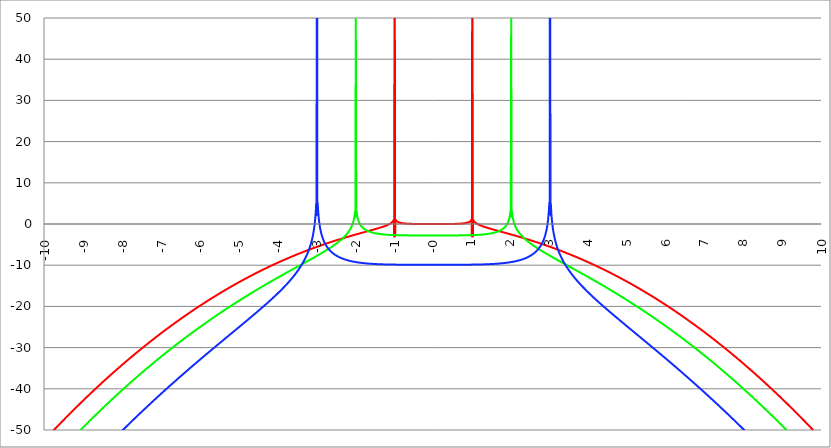
| Category | Series 1 | Series 0 | Series 2 |
|---|---|---|---|
| -10.0 | -52.298 | -59.129 | -70.299 |
| -9.99 | -52.197 | -59.025 | -70.189 |
| -9.98 | -52.096 | -58.921 | -70.079 |
| -9.97 | -51.995 | -58.817 | -69.97 |
| -9.96 | -51.894 | -58.713 | -69.86 |
| -9.95 | -51.794 | -58.609 | -69.751 |
| -9.940000000000001 | -51.693 | -58.505 | -69.641 |
| -9.930000000000001 | -51.593 | -58.402 | -69.532 |
| -9.920000000000002 | -51.493 | -58.298 | -69.423 |
| -9.91 | -51.392 | -58.195 | -69.313 |
| -9.900000000000002 | -51.292 | -58.092 | -69.204 |
| -9.890000000000002 | -51.192 | -57.989 | -69.095 |
| -9.880000000000003 | -51.093 | -57.886 | -68.987 |
| -9.870000000000003 | -50.993 | -57.783 | -68.878 |
| -9.860000000000001 | -50.893 | -57.68 | -68.769 |
| -9.850000000000003 | -50.794 | -57.577 | -68.66 |
| -9.840000000000003 | -50.694 | -57.474 | -68.552 |
| -9.830000000000004 | -50.595 | -57.372 | -68.443 |
| -9.820000000000004 | -50.495 | -57.269 | -68.335 |
| -9.810000000000004 | -50.396 | -57.167 | -68.227 |
| -9.800000000000004 | -50.297 | -57.064 | -68.119 |
| -9.790000000000004 | -50.198 | -56.962 | -68.011 |
| -9.780000000000005 | -50.099 | -56.86 | -67.903 |
| -9.770000000000005 | -50.001 | -56.758 | -67.795 |
| -9.760000000000005 | -49.902 | -56.656 | -67.687 |
| -9.750000000000005 | -49.803 | -56.554 | -67.579 |
| -9.740000000000006 | -49.705 | -56.453 | -67.471 |
| -9.730000000000006 | -49.606 | -56.351 | -67.364 |
| -9.720000000000006 | -49.508 | -56.249 | -67.256 |
| -9.710000000000006 | -49.41 | -56.148 | -67.149 |
| -9.700000000000006 | -49.312 | -56.047 | -67.042 |
| -9.690000000000007 | -49.214 | -55.945 | -66.934 |
| -9.680000000000007 | -49.116 | -55.844 | -66.827 |
| -9.670000000000007 | -49.018 | -55.743 | -66.72 |
| -9.660000000000007 | -48.92 | -55.642 | -66.613 |
| -9.650000000000007 | -48.823 | -55.541 | -66.506 |
| -9.640000000000008 | -48.725 | -55.44 | -66.4 |
| -9.630000000000008 | -48.628 | -55.34 | -66.293 |
| -9.620000000000008 | -48.531 | -55.239 | -66.186 |
| -9.610000000000008 | -48.433 | -55.139 | -66.08 |
| -9.600000000000009 | -48.336 | -55.038 | -65.973 |
| -9.590000000000009 | -48.239 | -54.938 | -65.867 |
| -9.580000000000007 | -48.142 | -54.838 | -65.761 |
| -9.57000000000001 | -48.046 | -54.738 | -65.655 |
| -9.56000000000001 | -47.949 | -54.638 | -65.549 |
| -9.55000000000001 | -47.852 | -54.538 | -65.443 |
| -9.54000000000001 | -47.756 | -54.438 | -65.337 |
| -9.53000000000001 | -47.659 | -54.338 | -65.231 |
| -9.52000000000001 | -47.563 | -54.239 | -65.125 |
| -9.51000000000001 | -47.467 | -54.139 | -65.019 |
| -9.50000000000001 | -47.371 | -54.04 | -64.914 |
| -9.49000000000001 | -47.275 | -53.94 | -64.808 |
| -9.48000000000001 | -47.179 | -53.841 | -64.703 |
| -9.47000000000001 | -47.083 | -53.742 | -64.598 |
| -9.46000000000001 | -46.987 | -53.643 | -64.492 |
| -9.45000000000001 | -46.892 | -53.544 | -64.387 |
| -9.44000000000001 | -46.796 | -53.445 | -64.282 |
| -9.430000000000012 | -46.701 | -53.346 | -64.177 |
| -9.420000000000012 | -46.605 | -53.247 | -64.072 |
| -9.410000000000013 | -46.51 | -53.149 | -63.968 |
| -9.400000000000013 | -46.415 | -53.05 | -63.863 |
| -9.390000000000011 | -46.32 | -52.952 | -63.758 |
| -9.380000000000013 | -46.225 | -52.853 | -63.654 |
| -9.370000000000013 | -46.13 | -52.755 | -63.549 |
| -9.360000000000014 | -46.036 | -52.657 | -63.445 |
| -9.350000000000014 | -45.941 | -52.559 | -63.341 |
| -9.340000000000014 | -45.846 | -52.461 | -63.237 |
| -9.330000000000014 | -45.752 | -52.363 | -63.132 |
| -9.320000000000014 | -45.658 | -52.266 | -63.028 |
| -9.310000000000015 | -45.563 | -52.168 | -62.925 |
| -9.300000000000013 | -45.469 | -52.07 | -62.821 |
| -9.290000000000015 | -45.375 | -51.973 | -62.717 |
| -9.280000000000015 | -45.281 | -51.876 | -62.613 |
| -9.270000000000016 | -45.187 | -51.778 | -62.51 |
| -9.260000000000016 | -45.094 | -51.681 | -62.406 |
| -9.250000000000014 | -45 | -51.584 | -62.303 |
| -9.240000000000016 | -44.906 | -51.487 | -62.199 |
| -9.230000000000016 | -44.813 | -51.39 | -62.096 |
| -9.220000000000017 | -44.72 | -51.293 | -61.993 |
| -9.210000000000017 | -44.626 | -51.197 | -61.89 |
| -9.200000000000017 | -44.533 | -51.1 | -61.787 |
| -9.190000000000017 | -44.44 | -51.003 | -61.684 |
| -9.180000000000017 | -44.347 | -50.907 | -61.581 |
| -9.170000000000018 | -44.254 | -50.811 | -61.478 |
| -9.160000000000016 | -44.162 | -50.714 | -61.376 |
| -9.150000000000018 | -44.069 | -50.618 | -61.273 |
| -9.140000000000018 | -43.976 | -50.522 | -61.171 |
| -9.130000000000019 | -43.884 | -50.426 | -61.068 |
| -9.120000000000019 | -43.792 | -50.331 | -60.966 |
| -9.110000000000017 | -43.699 | -50.235 | -60.864 |
| -9.10000000000002 | -43.607 | -50.139 | -60.762 |
| -9.09000000000002 | -43.515 | -50.044 | -60.66 |
| -9.08000000000002 | -43.423 | -49.948 | -60.558 |
| -9.07000000000002 | -43.331 | -49.853 | -60.456 |
| -9.06000000000002 | -43.24 | -49.757 | -60.354 |
| -9.05000000000002 | -43.148 | -49.662 | -60.252 |
| -9.04000000000002 | -43.056 | -49.567 | -60.151 |
| -9.03000000000002 | -42.965 | -49.472 | -60.049 |
| -9.020000000000021 | -42.873 | -49.377 | -59.948 |
| -9.010000000000021 | -42.782 | -49.282 | -59.846 |
| -9.000000000000021 | -42.691 | -49.188 | -59.745 |
| -8.990000000000022 | -42.6 | -49.093 | -59.644 |
| -8.980000000000022 | -42.509 | -48.998 | -59.543 |
| -8.97000000000002 | -42.418 | -48.904 | -59.442 |
| -8.960000000000022 | -42.327 | -48.81 | -59.341 |
| -8.950000000000022 | -42.237 | -48.715 | -59.24 |
| -8.940000000000023 | -42.146 | -48.621 | -59.139 |
| -8.930000000000023 | -42.056 | -48.527 | -59.038 |
| -8.920000000000023 | -41.965 | -48.433 | -58.938 |
| -8.910000000000023 | -41.875 | -48.339 | -58.837 |
| -8.900000000000023 | -41.785 | -48.246 | -58.737 |
| -8.890000000000024 | -41.695 | -48.152 | -58.636 |
| -8.880000000000024 | -41.605 | -48.058 | -58.536 |
| -8.870000000000024 | -41.515 | -47.965 | -58.436 |
| -8.860000000000024 | -41.425 | -47.871 | -58.336 |
| -8.850000000000025 | -41.335 | -47.778 | -58.236 |
| -8.840000000000025 | -41.246 | -47.685 | -58.136 |
| -8.830000000000025 | -41.156 | -47.592 | -58.036 |
| -8.820000000000025 | -41.067 | -47.499 | -57.936 |
| -8.810000000000025 | -40.977 | -47.406 | -57.836 |
| -8.800000000000026 | -40.888 | -47.313 | -57.737 |
| -8.790000000000026 | -40.799 | -47.22 | -57.637 |
| -8.780000000000026 | -40.71 | -47.128 | -57.538 |
| -8.770000000000026 | -40.621 | -47.035 | -57.438 |
| -8.760000000000026 | -40.532 | -46.943 | -57.339 |
| -8.750000000000027 | -40.444 | -46.85 | -57.24 |
| -8.740000000000027 | -40.355 | -46.758 | -57.141 |
| -8.730000000000027 | -40.267 | -46.666 | -57.042 |
| -8.720000000000027 | -40.178 | -46.574 | -56.943 |
| -8.710000000000027 | -40.09 | -46.482 | -56.844 |
| -8.700000000000028 | -40.002 | -46.39 | -56.745 |
| -8.690000000000028 | -39.914 | -46.298 | -56.647 |
| -8.680000000000028 | -39.826 | -46.206 | -56.548 |
| -8.670000000000028 | -39.738 | -46.115 | -56.449 |
| -8.660000000000029 | -39.65 | -46.023 | -56.351 |
| -8.650000000000029 | -39.562 | -45.932 | -56.253 |
| -8.640000000000029 | -39.474 | -45.84 | -56.154 |
| -8.63000000000003 | -39.387 | -45.749 | -56.056 |
| -8.62000000000003 | -39.3 | -45.658 | -55.958 |
| -8.61000000000003 | -39.212 | -45.567 | -55.86 |
| -8.60000000000003 | -39.125 | -45.476 | -55.762 |
| -8.59000000000003 | -39.038 | -45.385 | -55.664 |
| -8.58000000000003 | -38.951 | -45.294 | -55.566 |
| -8.57000000000003 | -38.864 | -45.204 | -55.469 |
| -8.56000000000003 | -38.777 | -45.113 | -55.371 |
| -8.55000000000003 | -38.69 | -45.022 | -55.273 |
| -8.540000000000031 | -38.604 | -44.932 | -55.176 |
| -8.530000000000031 | -38.517 | -44.842 | -55.079 |
| -8.520000000000032 | -38.431 | -44.752 | -54.981 |
| -8.510000000000032 | -38.344 | -44.661 | -54.884 |
| -8.50000000000003 | -38.258 | -44.571 | -54.787 |
| -8.490000000000032 | -38.172 | -44.481 | -54.69 |
| -8.480000000000032 | -38.086 | -44.392 | -54.593 |
| -8.470000000000033 | -38 | -44.302 | -54.496 |
| -8.460000000000033 | -37.914 | -44.212 | -54.399 |
| -8.450000000000033 | -37.828 | -44.123 | -54.302 |
| -8.440000000000033 | -37.743 | -44.033 | -54.206 |
| -8.430000000000033 | -37.657 | -43.944 | -54.109 |
| -8.420000000000034 | -37.572 | -43.854 | -54.013 |
| -8.410000000000032 | -37.486 | -43.765 | -53.916 |
| -8.400000000000034 | -37.401 | -43.676 | -53.82 |
| -8.390000000000034 | -37.316 | -43.587 | -53.724 |
| -8.380000000000035 | -37.231 | -43.498 | -53.628 |
| -8.370000000000035 | -37.146 | -43.409 | -53.532 |
| -8.360000000000033 | -37.061 | -43.321 | -53.436 |
| -8.350000000000035 | -36.976 | -43.232 | -53.34 |
| -8.340000000000035 | -36.892 | -43.144 | -53.244 |
| -8.330000000000036 | -36.807 | -43.055 | -53.148 |
| -8.320000000000036 | -36.723 | -42.967 | -53.052 |
| -8.310000000000034 | -36.638 | -42.879 | -52.957 |
| -8.300000000000036 | -36.554 | -42.79 | -52.861 |
| -8.290000000000036 | -36.47 | -42.702 | -52.766 |
| -8.280000000000037 | -36.386 | -42.614 | -52.671 |
| -8.270000000000037 | -36.302 | -42.526 | -52.575 |
| -8.260000000000037 | -36.218 | -42.439 | -52.48 |
| -8.250000000000037 | -36.134 | -42.351 | -52.385 |
| -8.240000000000038 | -36.05 | -42.263 | -52.29 |
| -8.230000000000038 | -35.967 | -42.176 | -52.195 |
| -8.220000000000038 | -35.883 | -42.088 | -52.1 |
| -8.210000000000038 | -35.8 | -42.001 | -52.005 |
| -8.200000000000038 | -35.717 | -41.914 | -51.911 |
| -8.190000000000039 | -35.633 | -41.827 | -51.816 |
| -8.180000000000039 | -35.55 | -41.74 | -51.721 |
| -8.170000000000037 | -35.467 | -41.653 | -51.627 |
| -8.16000000000004 | -35.384 | -41.566 | -51.533 |
| -8.15000000000004 | -35.302 | -41.479 | -51.438 |
| -8.14000000000004 | -35.219 | -41.392 | -51.344 |
| -8.13000000000004 | -35.136 | -41.306 | -51.25 |
| -8.12000000000004 | -35.054 | -41.219 | -51.156 |
| -8.11000000000004 | -34.971 | -41.133 | -51.062 |
| -8.10000000000004 | -34.889 | -41.047 | -50.968 |
| -8.09000000000004 | -34.807 | -40.96 | -50.874 |
| -8.08000000000004 | -34.725 | -40.874 | -50.78 |
| -8.07000000000004 | -34.643 | -40.788 | -50.687 |
| -8.06000000000004 | -34.561 | -40.702 | -50.593 |
| -8.05000000000004 | -34.479 | -40.617 | -50.499 |
| -8.040000000000042 | -34.397 | -40.531 | -50.406 |
| -8.03000000000004 | -34.316 | -40.445 | -50.313 |
| -8.020000000000042 | -34.234 | -40.36 | -50.219 |
| -8.010000000000042 | -34.153 | -40.274 | -50.126 |
| -8.000000000000043 | -34.072 | -40.189 | -50.033 |
| -7.990000000000043 | -33.99 | -40.103 | -49.94 |
| -7.980000000000043 | -33.909 | -40.018 | -49.847 |
| -7.970000000000043 | -33.828 | -39.933 | -49.754 |
| -7.960000000000043 | -33.747 | -39.848 | -49.661 |
| -7.950000000000044 | -33.666 | -39.763 | -49.569 |
| -7.940000000000044 | -33.586 | -39.678 | -49.476 |
| -7.930000000000044 | -33.505 | -39.594 | -49.383 |
| -7.920000000000044 | -33.425 | -39.509 | -49.291 |
| -7.910000000000044 | -33.344 | -39.424 | -49.198 |
| -7.900000000000044 | -33.264 | -39.34 | -49.106 |
| -7.890000000000045 | -33.184 | -39.256 | -49.014 |
| -7.880000000000045 | -33.103 | -39.171 | -48.922 |
| -7.870000000000045 | -33.023 | -39.087 | -48.829 |
| -7.860000000000046 | -32.943 | -39.003 | -48.737 |
| -7.850000000000046 | -32.864 | -38.919 | -48.645 |
| -7.840000000000046 | -32.784 | -38.835 | -48.554 |
| -7.830000000000046 | -32.704 | -38.751 | -48.462 |
| -7.820000000000046 | -32.625 | -38.668 | -48.37 |
| -7.810000000000047 | -32.545 | -38.584 | -48.278 |
| -7.800000000000047 | -32.466 | -38.5 | -48.187 |
| -7.790000000000047 | -32.387 | -38.417 | -48.095 |
| -7.780000000000047 | -32.307 | -38.334 | -48.004 |
| -7.770000000000047 | -32.228 | -38.25 | -47.912 |
| -7.760000000000048 | -32.149 | -38.167 | -47.821 |
| -7.750000000000048 | -32.071 | -38.084 | -47.73 |
| -7.740000000000048 | -31.992 | -38.001 | -47.639 |
| -7.730000000000048 | -31.913 | -37.918 | -47.548 |
| -7.720000000000049 | -31.835 | -37.836 | -47.457 |
| -7.710000000000049 | -31.756 | -37.753 | -47.366 |
| -7.700000000000049 | -31.678 | -37.67 | -47.275 |
| -7.690000000000049 | -31.599 | -37.588 | -47.184 |
| -7.680000000000049 | -31.521 | -37.505 | -47.094 |
| -7.67000000000005 | -31.443 | -37.423 | -47.003 |
| -7.66000000000005 | -31.365 | -37.341 | -46.913 |
| -7.65000000000005 | -31.287 | -37.258 | -46.822 |
| -7.64000000000005 | -31.21 | -37.176 | -46.732 |
| -7.63000000000005 | -31.132 | -37.094 | -46.642 |
| -7.620000000000051 | -31.054 | -37.013 | -46.551 |
| -7.610000000000051 | -30.977 | -36.931 | -46.461 |
| -7.600000000000051 | -30.899 | -36.849 | -46.371 |
| -7.590000000000051 | -30.822 | -36.767 | -46.281 |
| -7.580000000000052 | -30.745 | -36.686 | -46.191 |
| -7.570000000000052 | -30.668 | -36.605 | -46.101 |
| -7.560000000000052 | -30.591 | -36.523 | -46.012 |
| -7.550000000000052 | -30.514 | -36.442 | -45.922 |
| -7.540000000000052 | -30.437 | -36.361 | -45.832 |
| -7.530000000000053 | -30.36 | -36.28 | -45.743 |
| -7.520000000000053 | -30.284 | -36.199 | -45.653 |
| -7.510000000000053 | -30.207 | -36.118 | -45.564 |
| -7.500000000000053 | -30.131 | -36.037 | -45.475 |
| -7.490000000000053 | -30.055 | -35.956 | -45.385 |
| -7.480000000000054 | -29.978 | -35.876 | -45.296 |
| -7.470000000000054 | -29.902 | -35.795 | -45.207 |
| -7.460000000000054 | -29.826 | -35.715 | -45.118 |
| -7.450000000000054 | -29.75 | -35.635 | -45.029 |
| -7.440000000000054 | -29.675 | -35.554 | -44.94 |
| -7.430000000000054 | -29.599 | -35.474 | -44.851 |
| -7.420000000000055 | -29.523 | -35.394 | -44.763 |
| -7.410000000000055 | -29.448 | -35.314 | -44.674 |
| -7.400000000000055 | -29.372 | -35.234 | -44.585 |
| -7.390000000000056 | -29.297 | -35.154 | -44.497 |
| -7.380000000000056 | -29.222 | -35.075 | -44.408 |
| -7.370000000000056 | -29.147 | -34.995 | -44.32 |
| -7.360000000000056 | -29.072 | -34.916 | -44.232 |
| -7.350000000000056 | -28.997 | -34.836 | -44.143 |
| -7.340000000000057 | -28.922 | -34.757 | -44.055 |
| -7.330000000000057 | -28.847 | -34.678 | -43.967 |
| -7.320000000000057 | -28.772 | -34.598 | -43.879 |
| -7.310000000000057 | -28.698 | -34.519 | -43.791 |
| -7.300000000000058 | -28.623 | -34.44 | -43.703 |
| -7.290000000000058 | -28.549 | -34.362 | -43.616 |
| -7.280000000000058 | -28.475 | -34.283 | -43.528 |
| -7.270000000000058 | -28.401 | -34.204 | -43.44 |
| -7.260000000000058 | -28.327 | -34.125 | -43.353 |
| -7.250000000000059 | -28.253 | -34.047 | -43.265 |
| -7.240000000000059 | -28.179 | -33.969 | -43.178 |
| -7.23000000000006 | -28.105 | -33.89 | -43.09 |
| -7.220000000000059 | -28.031 | -33.812 | -43.003 |
| -7.210000000000059 | -27.958 | -33.734 | -42.916 |
| -7.20000000000006 | -27.884 | -33.656 | -42.829 |
| -7.19000000000006 | -27.811 | -33.578 | -42.742 |
| -7.18000000000006 | -27.738 | -33.5 | -42.655 |
| -7.17000000000006 | -27.665 | -33.422 | -42.568 |
| -7.160000000000061 | -27.591 | -33.344 | -42.481 |
| -7.150000000000061 | -27.518 | -33.267 | -42.394 |
| -7.140000000000061 | -27.446 | -33.189 | -42.307 |
| -7.130000000000061 | -27.373 | -33.112 | -42.22 |
| -7.120000000000061 | -27.3 | -33.034 | -42.134 |
| -7.110000000000062 | -27.228 | -32.957 | -42.047 |
| -7.100000000000062 | -27.155 | -32.88 | -41.961 |
| -7.090000000000062 | -27.083 | -32.803 | -41.874 |
| -7.080000000000062 | -27.01 | -32.726 | -41.788 |
| -7.070000000000062 | -26.938 | -32.649 | -41.702 |
| -7.060000000000063 | -26.866 | -32.572 | -41.616 |
| -7.050000000000063 | -26.794 | -32.496 | -41.53 |
| -7.040000000000063 | -26.722 | -32.419 | -41.443 |
| -7.030000000000063 | -26.65 | -32.342 | -41.358 |
| -7.020000000000064 | -26.579 | -32.266 | -41.272 |
| -7.010000000000064 | -26.507 | -32.19 | -41.186 |
| -7.000000000000064 | -26.436 | -32.113 | -41.1 |
| -6.990000000000064 | -26.364 | -32.037 | -41.014 |
| -6.980000000000064 | -26.293 | -31.961 | -40.929 |
| -6.970000000000064 | -26.222 | -31.885 | -40.843 |
| -6.960000000000064 | -26.151 | -31.809 | -40.757 |
| -6.950000000000064 | -26.08 | -31.733 | -40.672 |
| -6.940000000000065 | -26.009 | -31.658 | -40.587 |
| -6.930000000000065 | -25.938 | -31.582 | -40.501 |
| -6.920000000000065 | -25.867 | -31.506 | -40.416 |
| -6.910000000000065 | -25.796 | -31.431 | -40.331 |
| -6.900000000000066 | -25.726 | -31.356 | -40.246 |
| -6.890000000000066 | -25.655 | -31.28 | -40.161 |
| -6.880000000000066 | -25.585 | -31.205 | -40.076 |
| -6.870000000000066 | -25.515 | -31.13 | -39.991 |
| -6.860000000000067 | -25.445 | -31.055 | -39.906 |
| -6.850000000000067 | -25.375 | -30.98 | -39.821 |
| -6.840000000000067 | -25.305 | -30.905 | -39.736 |
| -6.830000000000067 | -25.235 | -30.83 | -39.652 |
| -6.820000000000068 | -25.165 | -30.756 | -39.567 |
| -6.810000000000068 | -25.096 | -30.681 | -39.483 |
| -6.800000000000068 | -25.026 | -30.607 | -39.398 |
| -6.790000000000068 | -24.957 | -30.532 | -39.314 |
| -6.780000000000068 | -24.887 | -30.458 | -39.229 |
| -6.770000000000068 | -24.818 | -30.384 | -39.145 |
| -6.760000000000069 | -24.749 | -30.31 | -39.061 |
| -6.75000000000007 | -24.68 | -30.236 | -38.977 |
| -6.74000000000007 | -24.611 | -30.162 | -38.893 |
| -6.73000000000007 | -24.542 | -30.088 | -38.809 |
| -6.72000000000007 | -24.473 | -30.014 | -38.725 |
| -6.71000000000007 | -24.404 | -29.94 | -38.641 |
| -6.70000000000007 | -24.336 | -29.867 | -38.557 |
| -6.69000000000007 | -24.267 | -29.793 | -38.473 |
| -6.680000000000071 | -24.199 | -29.72 | -38.39 |
| -6.670000000000071 | -24.131 | -29.647 | -38.306 |
| -6.660000000000071 | -24.063 | -29.573 | -38.222 |
| -6.650000000000071 | -23.994 | -29.5 | -38.139 |
| -6.640000000000072 | -23.926 | -29.427 | -38.055 |
| -6.630000000000072 | -23.859 | -29.354 | -37.972 |
| -6.620000000000072 | -23.791 | -29.281 | -37.889 |
| -6.610000000000072 | -23.723 | -29.208 | -37.805 |
| -6.600000000000072 | -23.655 | -29.136 | -37.722 |
| -6.590000000000073 | -23.588 | -29.063 | -37.639 |
| -6.580000000000073 | -23.521 | -28.99 | -37.556 |
| -6.570000000000073 | -23.453 | -28.918 | -37.473 |
| -6.560000000000073 | -23.386 | -28.846 | -37.39 |
| -6.550000000000074 | -23.319 | -28.773 | -37.307 |
| -6.540000000000074 | -23.252 | -28.701 | -37.224 |
| -6.530000000000074 | -23.185 | -28.629 | -37.141 |
| -6.520000000000074 | -23.118 | -28.557 | -37.059 |
| -6.510000000000074 | -23.051 | -28.485 | -36.976 |
| -6.500000000000074 | -22.985 | -28.413 | -36.893 |
| -6.490000000000074 | -22.918 | -28.342 | -36.811 |
| -6.480000000000074 | -22.852 | -28.27 | -36.728 |
| -6.470000000000075 | -22.786 | -28.198 | -36.646 |
| -6.460000000000075 | -22.719 | -28.127 | -36.563 |
| -6.450000000000075 | -22.653 | -28.055 | -36.481 |
| -6.440000000000075 | -22.587 | -27.984 | -36.399 |
| -6.430000000000076 | -22.521 | -27.913 | -36.317 |
| -6.420000000000076 | -22.455 | -27.842 | -36.234 |
| -6.410000000000076 | -22.39 | -27.771 | -36.152 |
| -6.400000000000076 | -22.324 | -27.7 | -36.07 |
| -6.390000000000077 | -22.258 | -27.629 | -35.988 |
| -6.380000000000077 | -22.193 | -27.558 | -35.906 |
| -6.370000000000077 | -22.128 | -27.487 | -35.824 |
| -6.360000000000078 | -22.062 | -27.417 | -35.743 |
| -6.350000000000078 | -21.997 | -27.346 | -35.661 |
| -6.340000000000078 | -21.932 | -27.276 | -35.579 |
| -6.330000000000078 | -21.867 | -27.205 | -35.497 |
| -6.320000000000078 | -21.802 | -27.135 | -35.416 |
| -6.310000000000079 | -21.737 | -27.065 | -35.334 |
| -6.300000000000079 | -21.673 | -26.995 | -35.253 |
| -6.29000000000008 | -21.608 | -26.925 | -35.171 |
| -6.28000000000008 | -21.544 | -26.855 | -35.09 |
| -6.27000000000008 | -21.479 | -26.785 | -35.009 |
| -6.26000000000008 | -21.415 | -26.715 | -34.927 |
| -6.25000000000008 | -21.351 | -26.646 | -34.846 |
| -6.24000000000008 | -21.287 | -26.576 | -34.765 |
| -6.23000000000008 | -21.223 | -26.506 | -34.684 |
| -6.220000000000081 | -21.159 | -26.437 | -34.603 |
| -6.210000000000081 | -21.095 | -26.368 | -34.522 |
| -6.200000000000081 | -21.031 | -26.298 | -34.441 |
| -6.190000000000081 | -20.968 | -26.229 | -34.36 |
| -6.180000000000081 | -20.904 | -26.16 | -34.279 |
| -6.170000000000082 | -20.841 | -26.091 | -34.198 |
| -6.160000000000082 | -20.778 | -26.022 | -34.117 |
| -6.150000000000082 | -20.714 | -25.954 | -34.036 |
| -6.140000000000082 | -20.651 | -25.885 | -33.956 |
| -6.130000000000082 | -20.588 | -25.816 | -33.875 |
| -6.120000000000083 | -20.525 | -25.748 | -33.795 |
| -6.110000000000083 | -20.462 | -25.679 | -33.714 |
| -6.100000000000083 | -20.4 | -25.611 | -33.634 |
| -6.090000000000083 | -20.337 | -25.542 | -33.553 |
| -6.080000000000084 | -20.274 | -25.474 | -33.473 |
| -6.070000000000084 | -20.212 | -25.406 | -33.392 |
| -6.060000000000084 | -20.15 | -25.338 | -33.312 |
| -6.050000000000084 | -20.087 | -25.27 | -33.232 |
| -6.040000000000084 | -20.025 | -25.202 | -33.152 |
| -6.030000000000084 | -19.963 | -25.134 | -33.071 |
| -6.020000000000085 | -19.901 | -25.067 | -32.991 |
| -6.010000000000085 | -19.839 | -24.999 | -32.911 |
| -6.000000000000085 | -19.778 | -24.931 | -32.831 |
| -5.990000000000085 | -19.716 | -24.864 | -32.751 |
| -5.980000000000085 | -19.654 | -24.797 | -32.671 |
| -5.970000000000085 | -19.593 | -24.729 | -32.591 |
| -5.960000000000086 | -19.532 | -24.662 | -32.512 |
| -5.950000000000086 | -19.47 | -24.595 | -32.432 |
| -5.940000000000086 | -19.409 | -24.528 | -32.352 |
| -5.930000000000086 | -19.348 | -24.461 | -32.272 |
| -5.920000000000087 | -19.287 | -24.394 | -32.193 |
| -5.910000000000087 | -19.226 | -24.327 | -32.113 |
| -5.900000000000087 | -19.165 | -24.261 | -32.033 |
| -5.890000000000088 | -19.105 | -24.194 | -31.954 |
| -5.880000000000088 | -19.044 | -24.128 | -31.874 |
| -5.870000000000088 | -18.984 | -24.061 | -31.795 |
| -5.860000000000088 | -18.923 | -23.995 | -31.715 |
| -5.850000000000088 | -18.863 | -23.928 | -31.636 |
| -5.840000000000089 | -18.803 | -23.862 | -31.557 |
| -5.830000000000089 | -18.743 | -23.796 | -31.477 |
| -5.820000000000089 | -18.683 | -23.73 | -31.398 |
| -5.810000000000089 | -18.623 | -23.664 | -31.319 |
| -5.800000000000089 | -18.563 | -23.598 | -31.24 |
| -5.79000000000009 | -18.503 | -23.532 | -31.161 |
| -5.78000000000009 | -18.443 | -23.467 | -31.081 |
| -5.77000000000009 | -18.384 | -23.401 | -31.002 |
| -5.76000000000009 | -18.324 | -23.336 | -30.923 |
| -5.750000000000091 | -18.265 | -23.27 | -30.844 |
| -5.740000000000091 | -18.206 | -23.205 | -30.765 |
| -5.730000000000091 | -18.147 | -23.139 | -30.686 |
| -5.720000000000091 | -18.088 | -23.074 | -30.607 |
| -5.710000000000091 | -18.029 | -23.009 | -30.528 |
| -5.700000000000092 | -17.97 | -22.944 | -30.45 |
| -5.690000000000092 | -17.911 | -22.879 | -30.371 |
| -5.680000000000092 | -17.852 | -22.814 | -30.292 |
| -5.670000000000092 | -17.794 | -22.749 | -30.213 |
| -5.660000000000092 | -17.735 | -22.685 | -30.134 |
| -5.650000000000093 | -17.677 | -22.62 | -30.056 |
| -5.640000000000093 | -17.619 | -22.556 | -29.977 |
| -5.630000000000093 | -17.561 | -22.491 | -29.898 |
| -5.620000000000093 | -17.502 | -22.427 | -29.82 |
| -5.610000000000093 | -17.444 | -22.362 | -29.741 |
| -5.600000000000094 | -17.387 | -22.298 | -29.663 |
| -5.590000000000094 | -17.329 | -22.234 | -29.584 |
| -5.580000000000094 | -17.271 | -22.17 | -29.506 |
| -5.570000000000094 | -17.213 | -22.106 | -29.427 |
| -5.560000000000095 | -17.156 | -22.042 | -29.349 |
| -5.550000000000095 | -17.099 | -21.978 | -29.27 |
| -5.540000000000095 | -17.041 | -21.914 | -29.192 |
| -5.530000000000095 | -16.984 | -21.851 | -29.114 |
| -5.520000000000095 | -16.927 | -21.787 | -29.035 |
| -5.510000000000096 | -16.87 | -21.724 | -28.957 |
| -5.500000000000096 | -16.813 | -21.66 | -28.879 |
| -5.490000000000096 | -16.756 | -21.597 | -28.8 |
| -5.480000000000096 | -16.699 | -21.534 | -28.722 |
| -5.470000000000096 | -16.643 | -21.471 | -28.644 |
| -5.460000000000097 | -16.586 | -21.407 | -28.566 |
| -5.450000000000097 | -16.53 | -21.344 | -28.487 |
| -5.440000000000097 | -16.473 | -21.281 | -28.409 |
| -5.430000000000097 | -16.417 | -21.219 | -28.331 |
| -5.420000000000098 | -16.361 | -21.156 | -28.253 |
| -5.410000000000098 | -16.305 | -21.093 | -28.175 |
| -5.400000000000098 | -16.249 | -21.031 | -28.097 |
| -5.390000000000098 | -16.193 | -20.968 | -28.019 |
| -5.380000000000098 | -16.137 | -20.905 | -27.94 |
| -5.370000000000099 | -16.082 | -20.843 | -27.862 |
| -5.360000000000099 | -16.026 | -20.781 | -27.784 |
| -5.350000000000099 | -15.971 | -20.719 | -27.706 |
| -5.340000000000099 | -15.915 | -20.656 | -27.628 |
| -5.330000000000099 | -15.86 | -20.594 | -27.55 |
| -5.3200000000001 | -15.805 | -20.532 | -27.472 |
| -5.3100000000001 | -15.75 | -20.47 | -27.394 |
| -5.3000000000001 | -15.695 | -20.409 | -27.316 |
| -5.2900000000001 | -15.64 | -20.347 | -27.238 |
| -5.2800000000001 | -15.585 | -20.285 | -27.16 |
| -5.2700000000001 | -15.53 | -20.224 | -27.082 |
| -5.260000000000101 | -15.476 | -20.162 | -27.004 |
| -5.250000000000101 | -15.421 | -20.101 | -26.926 |
| -5.240000000000101 | -15.367 | -20.039 | -26.848 |
| -5.230000000000101 | -15.312 | -19.978 | -26.77 |
| -5.220000000000102 | -15.258 | -19.917 | -26.693 |
| -5.210000000000102 | -15.204 | -19.856 | -26.615 |
| -5.200000000000102 | -15.15 | -19.794 | -26.537 |
| -5.190000000000103 | -15.096 | -19.733 | -26.459 |
| -5.180000000000103 | -15.042 | -19.673 | -26.381 |
| -5.170000000000103 | -14.988 | -19.612 | -26.303 |
| -5.160000000000103 | -14.935 | -19.551 | -26.225 |
| -5.150000000000103 | -14.881 | -19.49 | -26.147 |
| -5.140000000000104 | -14.828 | -19.43 | -26.069 |
| -5.130000000000104 | -14.774 | -19.369 | -25.991 |
| -5.120000000000104 | -14.721 | -19.309 | -25.913 |
| -5.110000000000104 | -14.668 | -19.248 | -25.835 |
| -5.100000000000104 | -14.615 | -19.188 | -25.757 |
| -5.090000000000104 | -14.562 | -19.128 | -25.679 |
| -5.080000000000104 | -14.509 | -19.068 | -25.601 |
| -5.070000000000105 | -14.456 | -19.008 | -25.523 |
| -5.060000000000105 | -14.403 | -18.948 | -25.445 |
| -5.050000000000105 | -14.351 | -18.888 | -25.367 |
| -5.040000000000105 | -14.298 | -18.828 | -25.289 |
| -5.030000000000105 | -14.246 | -18.768 | -25.211 |
| -5.020000000000106 | -14.193 | -18.708 | -25.133 |
| -5.010000000000106 | -14.141 | -18.649 | -25.055 |
| -5.000000000000106 | -14.089 | -18.589 | -24.977 |
| -4.990000000000106 | -14.037 | -18.53 | -24.899 |
| -4.980000000000106 | -13.985 | -18.47 | -24.82 |
| -4.970000000000107 | -13.933 | -18.411 | -24.742 |
| -4.960000000000107 | -13.881 | -18.352 | -24.664 |
| -4.950000000000107 | -13.83 | -18.292 | -24.586 |
| -4.940000000000107 | -13.778 | -18.233 | -24.508 |
| -4.930000000000108 | -13.727 | -18.174 | -24.429 |
| -4.920000000000108 | -13.675 | -18.115 | -24.351 |
| -4.910000000000108 | -13.624 | -18.056 | -24.273 |
| -4.900000000000108 | -13.573 | -17.997 | -24.194 |
| -4.890000000000109 | -13.522 | -17.939 | -24.116 |
| -4.88000000000011 | -13.471 | -17.88 | -24.037 |
| -4.87000000000011 | -13.42 | -17.821 | -23.959 |
| -4.86000000000011 | -13.369 | -17.763 | -23.88 |
| -4.85000000000011 | -13.319 | -17.704 | -23.802 |
| -4.84000000000011 | -13.268 | -17.646 | -23.723 |
| -4.83000000000011 | -13.217 | -17.588 | -23.645 |
| -4.82000000000011 | -13.167 | -17.529 | -23.566 |
| -4.810000000000111 | -13.117 | -17.471 | -23.487 |
| -4.800000000000111 | -13.066 | -17.413 | -23.409 |
| -4.790000000000111 | -13.016 | -17.355 | -23.33 |
| -4.780000000000111 | -12.966 | -17.297 | -23.251 |
| -4.770000000000111 | -12.916 | -17.239 | -23.172 |
| -4.760000000000112 | -12.866 | -17.181 | -23.093 |
| -4.750000000000112 | -12.817 | -17.124 | -23.014 |
| -4.740000000000112 | -12.767 | -17.066 | -22.935 |
| -4.730000000000112 | -12.718 | -17.008 | -22.856 |
| -4.720000000000112 | -12.668 | -16.951 | -22.777 |
| -4.710000000000113 | -12.619 | -16.893 | -22.698 |
| -4.700000000000113 | -12.569 | -16.836 | -22.618 |
| -4.690000000000113 | -12.52 | -16.778 | -22.539 |
| -4.680000000000113 | -12.471 | -16.721 | -22.46 |
| -4.670000000000114 | -12.422 | -16.664 | -22.38 |
| -4.660000000000114 | -12.373 | -16.607 | -22.301 |
| -4.650000000000114 | -12.324 | -16.55 | -22.221 |
| -4.640000000000114 | -12.276 | -16.493 | -22.141 |
| -4.630000000000114 | -12.227 | -16.436 | -22.061 |
| -4.620000000000115 | -12.179 | -16.379 | -21.982 |
| -4.610000000000115 | -12.13 | -16.322 | -21.902 |
| -4.600000000000115 | -12.082 | -16.265 | -21.822 |
| -4.590000000000115 | -12.034 | -16.208 | -21.742 |
| -4.580000000000115 | -11.985 | -16.152 | -21.661 |
| -4.570000000000115 | -11.937 | -16.095 | -21.581 |
| -4.560000000000116 | -11.889 | -16.039 | -21.501 |
| -4.550000000000116 | -11.842 | -15.982 | -21.42 |
| -4.540000000000116 | -11.794 | -15.926 | -21.34 |
| -4.530000000000116 | -11.746 | -15.87 | -21.259 |
| -4.520000000000117 | -11.699 | -15.813 | -21.178 |
| -4.510000000000117 | -11.651 | -15.757 | -21.098 |
| -4.500000000000117 | -11.604 | -15.701 | -21.017 |
| -4.490000000000117 | -11.556 | -15.645 | -20.936 |
| -4.480000000000117 | -11.509 | -15.589 | -20.854 |
| -4.470000000000117 | -11.462 | -15.533 | -20.773 |
| -4.460000000000118 | -11.415 | -15.477 | -20.692 |
| -4.450000000000118 | -11.368 | -15.422 | -20.61 |
| -4.440000000000118 | -11.321 | -15.366 | -20.529 |
| -4.430000000000118 | -11.275 | -15.31 | -20.447 |
| -4.420000000000119 | -11.228 | -15.255 | -20.365 |
| -4.41000000000012 | -11.182 | -15.199 | -20.283 |
| -4.40000000000012 | -11.135 | -15.144 | -20.201 |
| -4.39000000000012 | -11.089 | -15.088 | -20.118 |
| -4.38000000000012 | -11.042 | -15.033 | -20.036 |
| -4.37000000000012 | -10.996 | -14.977 | -19.953 |
| -4.36000000000012 | -10.95 | -14.922 | -19.871 |
| -4.35000000000012 | -10.904 | -14.867 | -19.788 |
| -4.34000000000012 | -10.858 | -14.812 | -19.705 |
| -4.33000000000012 | -10.813 | -14.757 | -19.622 |
| -4.320000000000121 | -10.767 | -14.702 | -19.538 |
| -4.310000000000121 | -10.721 | -14.647 | -19.455 |
| -4.300000000000121 | -10.676 | -14.592 | -19.371 |
| -4.290000000000121 | -10.63 | -14.537 | -19.287 |
| -4.280000000000121 | -10.585 | -14.482 | -19.203 |
| -4.270000000000122 | -10.54 | -14.428 | -19.119 |
| -4.260000000000122 | -10.495 | -14.373 | -19.035 |
| -4.250000000000122 | -10.45 | -14.318 | -18.95 |
| -4.240000000000122 | -10.405 | -14.264 | -18.865 |
| -4.230000000000122 | -10.36 | -14.209 | -18.78 |
| -4.220000000000123 | -10.315 | -14.155 | -18.695 |
| -4.210000000000123 | -10.27 | -14.1 | -18.609 |
| -4.200000000000123 | -10.226 | -14.046 | -18.524 |
| -4.190000000000124 | -10.181 | -13.992 | -18.438 |
| -4.180000000000124 | -10.137 | -13.937 | -18.352 |
| -4.170000000000124 | -10.093 | -13.883 | -18.266 |
| -4.160000000000124 | -10.049 | -13.829 | -18.179 |
| -4.150000000000124 | -10.004 | -13.775 | -18.092 |
| -4.140000000000124 | -9.96 | -13.721 | -18.005 |
| -4.130000000000125 | -9.917 | -13.667 | -17.918 |
| -4.120000000000125 | -9.873 | -13.613 | -17.83 |
| -4.110000000000125 | -9.829 | -13.559 | -17.742 |
| -4.100000000000125 | -9.785 | -13.505 | -17.654 |
| -4.090000000000125 | -9.742 | -13.452 | -17.566 |
| -4.080000000000126 | -9.698 | -13.398 | -17.477 |
| -4.070000000000126 | -9.655 | -13.344 | -17.388 |
| -4.060000000000126 | -9.612 | -13.291 | -17.299 |
| -4.050000000000126 | -9.569 | -13.237 | -17.209 |
| -4.040000000000127 | -9.525 | -13.184 | -17.12 |
| -4.030000000000127 | -9.482 | -13.13 | -17.029 |
| -4.020000000000127 | -9.44 | -13.077 | -16.939 |
| -4.010000000000127 | -9.397 | -13.023 | -16.848 |
| -4.000000000000127 | -9.354 | -12.97 | -16.757 |
| -3.990000000000128 | -9.311 | -12.917 | -16.665 |
| -3.980000000000128 | -9.269 | -12.863 | -16.573 |
| -3.970000000000129 | -9.226 | -12.81 | -16.481 |
| -3.960000000000129 | -9.184 | -12.757 | -16.388 |
| -3.950000000000129 | -9.142 | -12.704 | -16.295 |
| -3.940000000000129 | -9.1 | -12.651 | -16.201 |
| -3.930000000000129 | -9.058 | -12.598 | -16.107 |
| -3.92000000000013 | -9.016 | -12.545 | -16.013 |
| -3.91000000000013 | -8.974 | -12.492 | -15.918 |
| -3.90000000000013 | -8.932 | -12.439 | -15.823 |
| -3.89000000000013 | -8.89 | -12.386 | -15.727 |
| -3.88000000000013 | -8.849 | -12.333 | -15.631 |
| -3.870000000000131 | -8.807 | -12.28 | -15.534 |
| -3.860000000000131 | -8.766 | -12.227 | -15.437 |
| -3.850000000000131 | -8.724 | -12.175 | -15.339 |
| -3.840000000000131 | -8.683 | -12.122 | -15.241 |
| -3.830000000000131 | -8.642 | -12.069 | -15.142 |
| -3.820000000000132 | -8.601 | -12.016 | -15.043 |
| -3.810000000000132 | -8.56 | -11.964 | -14.943 |
| -3.800000000000132 | -8.519 | -11.911 | -14.842 |
| -3.790000000000132 | -8.478 | -11.859 | -14.741 |
| -3.780000000000132 | -8.438 | -11.806 | -14.639 |
| -3.770000000000133 | -8.397 | -11.754 | -14.537 |
| -3.760000000000133 | -8.357 | -11.701 | -14.433 |
| -3.750000000000133 | -8.316 | -11.649 | -14.33 |
| -3.740000000000133 | -8.276 | -11.596 | -14.225 |
| -3.730000000000134 | -8.236 | -11.544 | -14.12 |
| -3.720000000000134 | -8.195 | -11.492 | -14.014 |
| -3.710000000000134 | -8.155 | -11.439 | -13.907 |
| -3.700000000000134 | -8.115 | -11.387 | -13.799 |
| -3.690000000000134 | -8.076 | -11.335 | -13.691 |
| -3.680000000000135 | -8.036 | -11.283 | -13.582 |
| -3.670000000000135 | -7.996 | -11.23 | -13.472 |
| -3.660000000000135 | -7.956 | -11.178 | -13.361 |
| -3.650000000000135 | -7.917 | -11.126 | -13.249 |
| -3.640000000000135 | -7.878 | -11.074 | -13.136 |
| -3.630000000000136 | -7.838 | -11.022 | -13.022 |
| -3.620000000000136 | -7.799 | -10.97 | -12.906 |
| -3.610000000000136 | -7.76 | -10.918 | -12.79 |
| -3.600000000000136 | -7.721 | -10.866 | -12.673 |
| -3.590000000000137 | -7.682 | -10.813 | -12.555 |
| -3.580000000000137 | -7.643 | -10.761 | -12.435 |
| -3.570000000000137 | -7.604 | -10.709 | -12.314 |
| -3.560000000000137 | -7.565 | -10.657 | -12.192 |
| -3.550000000000137 | -7.527 | -10.605 | -12.069 |
| -3.540000000000138 | -7.488 | -10.553 | -11.944 |
| -3.530000000000138 | -7.45 | -10.501 | -11.817 |
| -3.520000000000138 | -7.412 | -10.449 | -11.689 |
| -3.510000000000138 | -7.373 | -10.397 | -11.56 |
| -3.500000000000139 | -7.335 | -10.345 | -11.429 |
| -3.490000000000139 | -7.297 | -10.293 | -11.296 |
| -3.480000000000139 | -7.259 | -10.241 | -11.162 |
| -3.470000000000139 | -7.221 | -10.19 | -11.025 |
| -3.460000000000139 | -7.183 | -10.138 | -10.887 |
| -3.45000000000014 | -7.146 | -10.086 | -10.746 |
| -3.44000000000014 | -7.108 | -10.034 | -10.604 |
| -3.43000000000014 | -7.071 | -9.982 | -10.459 |
| -3.42000000000014 | -7.033 | -9.93 | -10.312 |
| -3.41000000000014 | -6.996 | -9.878 | -10.162 |
| -3.400000000000141 | -6.959 | -9.826 | -10.01 |
| -3.390000000000141 | -6.921 | -9.774 | -9.855 |
| -3.380000000000141 | -6.884 | -9.722 | -9.697 |
| -3.370000000000141 | -6.847 | -9.67 | -9.537 |
| -3.360000000000141 | -6.81 | -9.618 | -9.372 |
| -3.350000000000142 | -6.774 | -9.566 | -9.205 |
| -3.340000000000142 | -6.737 | -9.514 | -9.034 |
| -3.330000000000142 | -6.7 | -9.462 | -8.859 |
| -3.320000000000142 | -6.664 | -9.409 | -8.68 |
| -3.310000000000143 | -6.627 | -9.357 | -8.497 |
| -3.300000000000143 | -6.591 | -9.305 | -8.31 |
| -3.290000000000143 | -6.554 | -9.253 | -8.117 |
| -3.280000000000143 | -6.518 | -9.201 | -7.919 |
| -3.270000000000143 | -6.482 | -9.149 | -7.715 |
| -3.260000000000144 | -6.446 | -9.096 | -7.506 |
| -3.250000000000144 | -6.41 | -9.044 | -7.29 |
| -3.240000000000144 | -6.374 | -8.992 | -7.066 |
| -3.230000000000144 | -6.339 | -8.939 | -6.835 |
| -3.220000000000145 | -6.303 | -8.887 | -6.596 |
| -3.210000000000145 | -6.267 | -8.834 | -6.347 |
| -3.200000000000145 | -6.232 | -8.782 | -6.088 |
| -3.190000000000145 | -6.196 | -8.729 | -5.818 |
| -3.180000000000145 | -6.161 | -8.677 | -5.536 |
| -3.170000000000146 | -6.126 | -8.624 | -5.239 |
| -3.160000000000146 | -6.091 | -8.572 | -4.928 |
| -3.150000000000146 | -6.056 | -8.519 | -4.598 |
| -3.140000000000146 | -6.021 | -8.466 | -4.249 |
| -3.130000000000146 | -5.986 | -8.413 | -3.877 |
| -3.120000000000147 | -5.951 | -8.36 | -3.478 |
| -3.110000000000147 | -5.916 | -8.307 | -3.048 |
| -3.100000000000147 | -5.881 | -8.254 | -2.581 |
| -3.090000000000147 | -5.847 | -8.201 | -2.068 |
| -3.080000000000147 | -5.812 | -8.148 | -1.5 |
| -3.070000000000148 | -5.778 | -8.094 | -0.861 |
| -3.060000000000148 | -5.744 | -8.041 | -0.129 |
| -3.050000000000148 | -5.71 | -7.988 | 0.729 |
| -3.040000000000148 | -5.675 | -7.934 | 1.771 |
| -3.030000000000149 | -5.641 | -7.88 | 3.104 |
| -3.020000000000149 | -5.607 | -7.827 | 4.966 |
| -3.010000000000149 | -5.574 | -7.773 | 8.123 |
| -3.000000000000149 | -5.54 | -7.719 | 120.337 |
| -2.990000000000149 | -5.506 | -7.665 | 8.198 |
| -2.98000000000015 | -5.472 | -7.611 | 5.116 |
| -2.97000000000015 | -5.439 | -7.556 | 3.329 |
| -2.96000000000015 | -5.405 | -7.502 | 2.071 |
| -2.95000000000015 | -5.372 | -7.447 | 1.104 |
| -2.94000000000015 | -5.339 | -7.393 | 0.321 |
| -2.930000000000151 | -5.306 | -7.338 | -0.336 |
| -2.920000000000151 | -5.272 | -7.283 | -0.9 |
| -2.910000000000151 | -5.239 | -7.228 | -1.393 |
| -2.900000000000151 | -5.206 | -7.173 | -1.831 |
| -2.890000000000151 | -5.174 | -7.117 | -2.223 |
| -2.880000000000152 | -5.141 | -7.062 | -2.578 |
| -2.870000000000152 | -5.108 | -7.006 | -2.902 |
| -2.860000000000152 | -5.075 | -6.95 | -3.199 |
| -2.850000000000152 | -5.043 | -6.894 | -3.473 |
| -2.840000000000153 | -5.01 | -6.838 | -3.727 |
| -2.830000000000153 | -4.978 | -6.781 | -3.964 |
| -2.820000000000153 | -4.946 | -6.725 | -4.185 |
| -2.810000000000153 | -4.914 | -6.668 | -4.393 |
| -2.800000000000153 | -4.881 | -6.611 | -4.588 |
| -2.790000000000154 | -4.849 | -6.554 | -4.772 |
| -2.780000000000154 | -4.817 | -6.496 | -4.945 |
| -2.770000000000154 | -4.785 | -6.438 | -5.11 |
| -2.760000000000154 | -4.754 | -6.38 | -5.266 |
| -2.750000000000154 | -4.722 | -6.322 | -5.414 |
| -2.740000000000155 | -4.69 | -6.264 | -5.556 |
| -2.730000000000155 | -4.659 | -6.205 | -5.69 |
| -2.720000000000155 | -4.627 | -6.146 | -5.819 |
| -2.710000000000155 | -4.596 | -6.086 | -5.942 |
| -2.700000000000156 | -4.564 | -6.027 | -6.059 |
| -2.690000000000156 | -4.533 | -5.967 | -6.172 |
| -2.680000000000156 | -4.502 | -5.906 | -6.28 |
| -2.670000000000156 | -4.471 | -5.846 | -6.384 |
| -2.660000000000156 | -4.44 | -5.785 | -6.484 |
| -2.650000000000157 | -4.409 | -5.723 | -6.58 |
| -2.640000000000157 | -4.378 | -5.662 | -6.672 |
| -2.630000000000157 | -4.347 | -5.599 | -6.761 |
| -2.620000000000157 | -4.317 | -5.537 | -6.847 |
| -2.610000000000157 | -4.286 | -5.474 | -6.929 |
| -2.600000000000158 | -4.255 | -5.41 | -7.009 |
| -2.590000000000158 | -4.225 | -5.347 | -7.086 |
| -2.580000000000158 | -4.195 | -5.282 | -7.161 |
| -2.570000000000158 | -4.164 | -5.217 | -7.233 |
| -2.560000000000159 | -4.134 | -5.152 | -7.303 |
| -2.550000000000159 | -4.104 | -5.086 | -7.37 |
| -2.54000000000016 | -4.074 | -5.019 | -7.435 |
| -2.530000000000159 | -4.044 | -4.952 | -7.499 |
| -2.520000000000159 | -4.014 | -4.884 | -7.56 |
| -2.51000000000016 | -3.984 | -4.816 | -7.62 |
| -2.50000000000016 | -3.954 | -4.747 | -7.677 |
| -2.49000000000016 | -3.924 | -4.677 | -7.733 |
| -2.48000000000016 | -3.895 | -4.607 | -7.788 |
| -2.47000000000016 | -3.865 | -4.535 | -7.84 |
| -2.460000000000161 | -3.836 | -4.463 | -7.891 |
| -2.450000000000161 | -3.806 | -4.39 | -7.941 |
| -2.440000000000161 | -3.777 | -4.316 | -7.99 |
| -2.430000000000161 | -3.748 | -4.241 | -8.037 |
| -2.420000000000162 | -3.718 | -4.165 | -8.082 |
| -2.410000000000162 | -3.689 | -4.089 | -8.127 |
| -2.400000000000162 | -3.66 | -4.011 | -8.17 |
| -2.390000000000162 | -3.631 | -3.931 | -8.212 |
| -2.380000000000162 | -3.602 | -3.851 | -8.253 |
| -2.370000000000163 | -3.573 | -3.769 | -8.293 |
| -2.360000000000163 | -3.545 | -3.686 | -8.332 |
| -2.350000000000163 | -3.516 | -3.602 | -8.37 |
| -2.340000000000163 | -3.487 | -3.516 | -8.406 |
| -2.330000000000163 | -3.459 | -3.428 | -8.442 |
| -2.320000000000164 | -3.43 | -3.339 | -8.477 |
| -2.310000000000164 | -3.402 | -3.248 | -8.511 |
| -2.300000000000164 | -3.373 | -3.154 | -8.545 |
| -2.290000000000164 | -3.345 | -3.059 | -8.577 |
| -2.280000000000165 | -3.317 | -2.961 | -8.609 |
| -2.270000000000165 | -3.288 | -2.861 | -8.639 |
| -2.260000000000165 | -3.26 | -2.758 | -8.669 |
| -2.250000000000165 | -3.232 | -2.652 | -8.699 |
| -2.240000000000165 | -3.204 | -2.544 | -8.727 |
| -2.230000000000166 | -3.176 | -2.432 | -8.755 |
| -2.220000000000166 | -3.148 | -2.316 | -8.782 |
| -2.210000000000166 | -3.12 | -2.196 | -8.809 |
| -2.200000000000166 | -3.093 | -2.071 | -8.835 |
| -2.190000000000166 | -3.065 | -1.942 | -8.86 |
| -2.180000000000167 | -3.037 | -1.807 | -8.885 |
| -2.170000000000167 | -3.01 | -1.666 | -8.909 |
| -2.160000000000167 | -2.982 | -1.519 | -8.932 |
| -2.150000000000167 | -2.955 | -1.363 | -8.955 |
| -2.140000000000168 | -2.927 | -1.199 | -8.978 |
| -2.130000000000168 | -2.9 | -1.025 | -9 |
| -2.120000000000168 | -2.873 | -0.838 | -9.021 |
| -2.110000000000168 | -2.846 | -0.638 | -9.042 |
| -2.100000000000168 | -2.818 | -0.422 | -9.062 |
| -2.090000000000169 | -2.791 | -0.185 | -9.082 |
| -2.080000000000169 | -2.764 | 0.076 | -9.102 |
| -2.070000000000169 | -2.737 | 0.369 | -9.121 |
| -2.060000000000169 | -2.71 | 0.703 | -9.14 |
| -2.050000000000169 | -2.683 | 1.093 | -9.158 |
| -2.04000000000017 | -2.656 | 1.564 | -9.175 |
| -2.03000000000017 | -2.63 | 2.165 | -9.193 |
| -2.02000000000017 | -2.603 | 3.001 | -9.21 |
| -2.01000000000017 | -2.576 | 4.413 | -9.226 |
| -2.000000000000171 | -2.549 | 54.027 | -9.242 |
| -1.99000000000017 | -2.523 | 4.463 | -9.258 |
| -1.98000000000017 | -2.496 | 3.101 | -9.274 |
| -1.97000000000017 | -2.47 | 2.315 | -9.289 |
| -1.96000000000017 | -2.443 | 1.764 | -9.304 |
| -1.95000000000017 | -2.417 | 1.343 | -9.318 |
| -1.94000000000017 | -2.39 | 1.003 | -9.332 |
| -1.93000000000017 | -2.364 | 0.719 | -9.346 |
| -1.92000000000017 | -2.337 | 0.476 | -9.359 |
| -1.91000000000017 | -2.311 | 0.265 | -9.373 |
| -1.90000000000017 | -2.285 | 0.078 | -9.385 |
| -1.89000000000017 | -2.258 | -0.088 | -9.398 |
| -1.88000000000017 | -2.232 | -0.238 | -9.41 |
| -1.87000000000017 | -2.206 | -0.375 | -9.422 |
| -1.86000000000017 | -2.18 | -0.499 | -9.434 |
| -1.85000000000017 | -2.154 | -0.613 | -9.446 |
| -1.84000000000017 | -2.128 | -0.719 | -9.457 |
| -1.83000000000017 | -2.101 | -0.816 | -9.468 |
| -1.82000000000017 | -2.075 | -0.907 | -9.478 |
| -1.81000000000017 | -2.049 | -0.992 | -9.489 |
| -1.80000000000017 | -2.023 | -1.071 | -9.499 |
| -1.79000000000017 | -1.997 | -1.145 | -9.509 |
| -1.78000000000017 | -1.971 | -1.215 | -9.519 |
| -1.77000000000017 | -1.945 | -1.281 | -9.529 |
| -1.76000000000017 | -1.919 | -1.343 | -9.538 |
| -1.75000000000017 | -1.893 | -1.402 | -9.547 |
| -1.74000000000017 | -1.867 | -1.458 | -9.556 |
| -1.73000000000017 | -1.841 | -1.511 | -9.565 |
| -1.72000000000017 | -1.815 | -1.561 | -9.573 |
| -1.71000000000017 | -1.789 | -1.608 | -9.582 |
| -1.70000000000017 | -1.763 | -1.654 | -9.59 |
| -1.69000000000017 | -1.737 | -1.697 | -9.598 |
| -1.68000000000017 | -1.711 | -1.738 | -9.605 |
| -1.67000000000017 | -1.685 | -1.778 | -9.613 |
| -1.66000000000017 | -1.659 | -1.815 | -9.62 |
| -1.65000000000017 | -1.633 | -1.851 | -9.628 |
| -1.64000000000017 | -1.607 | -1.885 | -9.635 |
| -1.63000000000017 | -1.581 | -1.918 | -9.642 |
| -1.62000000000017 | -1.555 | -1.95 | -9.648 |
| -1.61000000000017 | -1.529 | -1.98 | -9.655 |
| -1.60000000000017 | -1.502 | -2.009 | -9.661 |
| -1.59000000000017 | -1.476 | -2.037 | -9.668 |
| -1.58000000000017 | -1.45 | -2.064 | -9.674 |
| -1.57000000000017 | -1.423 | -2.09 | -9.68 |
| -1.56000000000017 | -1.397 | -2.114 | -9.686 |
| -1.55000000000017 | -1.37 | -2.138 | -9.691 |
| -1.54000000000017 | -1.344 | -2.161 | -9.697 |
| -1.53000000000017 | -1.317 | -2.183 | -9.702 |
| -1.52000000000017 | -1.29 | -2.204 | -9.708 |
| -1.51000000000017 | -1.264 | -2.225 | -9.713 |
| -1.50000000000017 | -1.237 | -2.244 | -9.718 |
| -1.49000000000017 | -1.21 | -2.263 | -9.723 |
| -1.48000000000017 | -1.182 | -2.281 | -9.728 |
| -1.47000000000017 | -1.155 | -2.299 | -9.732 |
| -1.46000000000017 | -1.128 | -2.316 | -9.737 |
| -1.45000000000017 | -1.1 | -2.332 | -9.741 |
| -1.44000000000017 | -1.072 | -2.348 | -9.746 |
| -1.43000000000017 | -1.044 | -2.363 | -9.75 |
| -1.42000000000017 | -1.016 | -2.378 | -9.754 |
| -1.41000000000017 | -0.988 | -2.392 | -9.758 |
| -1.40000000000017 | -0.96 | -2.406 | -9.762 |
| -1.39000000000017 | -0.931 | -2.419 | -9.766 |
| -1.38000000000017 | -0.902 | -2.432 | -9.77 |
| -1.37000000000017 | -0.873 | -2.444 | -9.773 |
| -1.36000000000017 | -0.843 | -2.456 | -9.777 |
| -1.35000000000017 | -0.814 | -2.468 | -9.781 |
| -1.34000000000017 | -0.783 | -2.479 | -9.784 |
| -1.33000000000017 | -0.753 | -2.489 | -9.787 |
| -1.32000000000017 | -0.722 | -2.5 | -9.79 |
| -1.31000000000017 | -0.691 | -2.51 | -9.794 |
| -1.30000000000017 | -0.659 | -2.519 | -9.797 |
| -1.29000000000017 | -0.627 | -2.529 | -9.8 |
| -1.28000000000017 | -0.595 | -2.538 | -9.802 |
| -1.27000000000017 | -0.562 | -2.547 | -9.805 |
| -1.26000000000017 | -0.528 | -2.555 | -9.808 |
| -1.25000000000017 | -0.494 | -2.563 | -9.811 |
| -1.24000000000017 | -0.458 | -2.571 | -9.813 |
| -1.23000000000017 | -0.423 | -2.579 | -9.816 |
| -1.22000000000017 | -0.386 | -2.586 | -9.818 |
| -1.21000000000017 | -0.348 | -2.593 | -9.821 |
| -1.20000000000017 | -0.31 | -2.6 | -9.823 |
| -1.19000000000017 | -0.27 | -2.607 | -9.825 |
| -1.18000000000017 | -0.228 | -2.613 | -9.827 |
| -1.17000000000017 | -0.186 | -2.619 | -9.829 |
| -1.16000000000017 | -0.142 | -2.625 | -9.832 |
| -1.15000000000017 | -0.095 | -2.631 | -9.834 |
| -1.14000000000017 | -0.047 | -2.637 | -9.836 |
| -1.13000000000017 | 0.004 | -2.642 | -9.837 |
| -1.12000000000017 | 0.057 | -2.647 | -9.839 |
| -1.11000000000017 | 0.114 | -2.652 | -9.841 |
| -1.10000000000017 | 0.175 | -2.657 | -9.843 |
| -1.09000000000017 | 0.241 | -2.662 | -9.844 |
| -1.08000000000017 | 0.313 | -2.666 | -9.846 |
| -1.07000000000017 | 0.393 | -2.671 | -9.848 |
| -1.06000000000017 | 0.484 | -2.675 | -9.849 |
| -1.05000000000017 | 0.588 | -2.679 | -9.851 |
| -1.04000000000017 | 0.712 | -2.683 | -9.852 |
| -1.03000000000017 | 0.869 | -2.687 | -9.854 |
| -1.02000000000017 | 1.084 | -2.69 | -9.855 |
| -1.01000000000017 | 1.443 | -2.694 | -9.856 |
| -1.00000000000017 | 100 | -2.697 | -9.857 |
| -0.99000000000017 | 1.468 | -2.7 | -9.859 |
| -0.98000000000017 | 1.134 | -2.704 | -9.86 |
| -0.97000000000017 | 0.944 | -2.707 | -9.861 |
| -0.96000000000017 | 0.812 | -2.71 | -9.862 |
| -0.95000000000017 | 0.713 | -2.712 | -9.863 |
| -0.94000000000017 | 0.634 | -2.715 | -9.864 |
| -0.93000000000017 | 0.568 | -2.718 | -9.865 |
| -0.92000000000017 | 0.514 | -2.72 | -9.866 |
| -0.91000000000017 | 0.466 | -2.723 | -9.867 |
| -0.90000000000017 | 0.425 | -2.725 | -9.868 |
| -0.890000000000169 | 0.389 | -2.727 | -9.869 |
| -0.880000000000169 | 0.357 | -2.729 | -9.87 |
| -0.870000000000169 | 0.329 | -2.732 | -9.871 |
| -0.860000000000169 | 0.303 | -2.733 | -9.871 |
| -0.850000000000169 | 0.28 | -2.735 | -9.872 |
| -0.840000000000169 | 0.259 | -2.737 | -9.873 |
| -0.830000000000169 | 0.239 | -2.739 | -9.874 |
| -0.820000000000169 | 0.222 | -2.741 | -9.874 |
| -0.810000000000169 | 0.206 | -2.742 | -9.875 |
| -0.800000000000169 | 0.191 | -2.744 | -9.876 |
| -0.790000000000169 | 0.177 | -2.745 | -9.876 |
| -0.780000000000169 | 0.165 | -2.747 | -9.877 |
| -0.770000000000169 | 0.153 | -2.748 | -9.877 |
| -0.760000000000169 | 0.142 | -2.749 | -9.878 |
| -0.750000000000169 | 0.132 | -2.751 | -9.878 |
| -0.740000000000169 | 0.123 | -2.752 | -9.879 |
| -0.730000000000169 | 0.114 | -2.753 | -9.879 |
| -0.720000000000169 | 0.106 | -2.754 | -9.88 |
| -0.710000000000169 | 0.099 | -2.755 | -9.88 |
| -0.700000000000169 | 0.092 | -2.756 | -9.881 |
| -0.690000000000169 | 0.085 | -2.757 | -9.881 |
| -0.680000000000169 | 0.079 | -2.758 | -9.881 |
| -0.670000000000169 | 0.073 | -2.759 | -9.882 |
| -0.660000000000169 | 0.068 | -2.76 | -9.882 |
| -0.650000000000169 | 0.063 | -2.761 | -9.882 |
| -0.640000000000169 | 0.059 | -2.761 | -9.883 |
| -0.630000000000169 | 0.054 | -2.762 | -9.883 |
| -0.620000000000169 | 0.05 | -2.763 | -9.883 |
| -0.610000000000169 | 0.047 | -2.763 | -9.884 |
| -0.600000000000169 | 0.043 | -2.764 | -9.884 |
| -0.590000000000169 | 0.04 | -2.765 | -9.884 |
| -0.580000000000169 | 0.037 | -2.765 | -9.884 |
| -0.570000000000169 | 0.034 | -2.766 | -9.885 |
| -0.560000000000169 | 0.031 | -2.766 | -9.885 |
| -0.550000000000169 | 0.029 | -2.767 | -9.885 |
| -0.540000000000169 | 0.027 | -2.767 | -9.885 |
| -0.530000000000169 | 0.024 | -2.767 | -9.885 |
| -0.520000000000169 | 0.022 | -2.768 | -9.885 |
| -0.510000000000169 | 0.021 | -2.768 | -9.886 |
| -0.500000000000169 | 0.019 | -2.769 | -9.886 |
| -0.490000000000169 | 0.017 | -2.769 | -9.886 |
| -0.480000000000169 | 0.016 | -2.769 | -9.886 |
| -0.470000000000169 | 0.014 | -2.769 | -9.886 |
| -0.460000000000169 | 0.013 | -2.77 | -9.886 |
| -0.450000000000169 | 0.012 | -2.77 | -9.886 |
| -0.440000000000169 | 0.011 | -2.77 | -9.886 |
| -0.430000000000169 | 0.01 | -2.77 | -9.887 |
| -0.420000000000169 | 0.009 | -2.771 | -9.887 |
| -0.410000000000169 | 0.008 | -2.771 | -9.887 |
| -0.400000000000169 | 0.007 | -2.771 | -9.887 |
| -0.390000000000169 | 0.006 | -2.771 | -9.887 |
| -0.380000000000169 | 0.006 | -2.771 | -9.887 |
| -0.370000000000169 | 0.005 | -2.771 | -9.887 |
| -0.360000000000169 | 0.005 | -2.772 | -9.887 |
| -0.350000000000169 | 0.004 | -2.772 | -9.887 |
| -0.340000000000169 | 0.004 | -2.772 | -9.887 |
| -0.330000000000169 | 0.003 | -2.772 | -9.887 |
| -0.320000000000169 | 0.003 | -2.772 | -9.887 |
| -0.310000000000169 | 0.002 | -2.772 | -9.887 |
| -0.300000000000169 | 0.002 | -2.772 | -9.887 |
| -0.290000000000169 | 0.002 | -2.772 | -9.887 |
| -0.280000000000169 | 0.002 | -2.772 | -9.887 |
| -0.270000000000169 | 0.001 | -2.772 | -9.887 |
| -0.260000000000169 | 0.001 | -2.772 | -9.887 |
| -0.250000000000169 | 0.001 | -2.772 | -9.887 |
| -0.240000000000169 | 0.001 | -2.772 | -9.887 |
| -0.230000000000169 | 0.001 | -2.772 | -9.887 |
| -0.220000000000169 | 0.001 | -2.772 | -9.887 |
| -0.210000000000169 | 0.001 | -2.772 | -9.887 |
| -0.200000000000169 | 0 | -2.772 | -9.887 |
| -0.190000000000169 | 0 | -2.773 | -9.887 |
| -0.180000000000169 | 0 | -2.773 | -9.887 |
| -0.170000000000169 | 0 | -2.773 | -9.887 |
| -0.160000000000169 | 0 | -2.773 | -9.887 |
| -0.150000000000169 | 0 | -2.773 | -9.887 |
| -0.140000000000169 | 0 | -2.773 | -9.887 |
| -0.130000000000169 | 0 | -2.773 | -9.888 |
| -0.120000000000169 | 0 | -2.773 | -9.888 |
| -0.110000000000169 | 0 | -2.773 | -9.888 |
| -0.100000000000169 | 0 | -2.773 | -9.888 |
| -0.0900000000001689 | 0 | -2.773 | -9.888 |
| -0.0800000000001689 | 0 | -2.773 | -9.888 |
| -0.0700000000001689 | 0 | -2.773 | -9.888 |
| -0.0600000000001689 | 0 | -2.773 | -9.888 |
| -0.0500000000001689 | 0 | -2.773 | -9.888 |
| -0.0400000000001689 | 0 | -2.773 | -9.888 |
| -0.0300000000001689 | 0 | -2.773 | -9.888 |
| -0.0200000000001689 | 0 | -2.773 | -9.888 |
| -0.0100000000001689 | 0 | -2.773 | -9.888 |
| -1.6888920817415e-13 | 0 | -2.773 | -9.888 |
| 0.00999999999983111 | 0 | -2.773 | -9.888 |
| 0.0199999999998311 | 0 | -2.773 | -9.888 |
| 0.0299999999998311 | 0 | -2.773 | -9.888 |
| 0.0399999999998311 | 0 | -2.773 | -9.888 |
| 0.0499999999998311 | 0 | -2.773 | -9.888 |
| 0.0599999999998311 | 0 | -2.773 | -9.888 |
| 0.0699999999998311 | 0 | -2.773 | -9.888 |
| 0.0799999999998311 | 0 | -2.773 | -9.888 |
| 0.0899999999998311 | 0 | -2.773 | -9.888 |
| 0.0999999999998311 | 0 | -2.773 | -9.888 |
| 0.109999999999831 | 0 | -2.773 | -9.888 |
| 0.119999999999831 | 0 | -2.773 | -9.888 |
| 0.129999999999831 | 0 | -2.773 | -9.888 |
| 0.139999999999831 | 0 | -2.773 | -9.887 |
| 0.149999999999831 | 0 | -2.773 | -9.887 |
| 0.159999999999831 | 0 | -2.773 | -9.887 |
| 0.169999999999831 | 0 | -2.773 | -9.887 |
| 0.179999999999831 | 0 | -2.773 | -9.887 |
| 0.189999999999831 | 0 | -2.773 | -9.887 |
| 0.199999999999831 | 0 | -2.772 | -9.887 |
| 0.209999999999831 | 0.001 | -2.772 | -9.887 |
| 0.219999999999831 | 0.001 | -2.772 | -9.887 |
| 0.229999999999831 | 0.001 | -2.772 | -9.887 |
| 0.239999999999831 | 0.001 | -2.772 | -9.887 |
| 0.249999999999831 | 0.001 | -2.772 | -9.887 |
| 0.259999999999831 | 0.001 | -2.772 | -9.887 |
| 0.269999999999831 | 0.001 | -2.772 | -9.887 |
| 0.279999999999831 | 0.002 | -2.772 | -9.887 |
| 0.289999999999831 | 0.002 | -2.772 | -9.887 |
| 0.299999999999831 | 0.002 | -2.772 | -9.887 |
| 0.309999999999831 | 0.002 | -2.772 | -9.887 |
| 0.319999999999831 | 0.003 | -2.772 | -9.887 |
| 0.329999999999831 | 0.003 | -2.772 | -9.887 |
| 0.339999999999831 | 0.004 | -2.772 | -9.887 |
| 0.349999999999831 | 0.004 | -2.772 | -9.887 |
| 0.359999999999831 | 0.005 | -2.772 | -9.887 |
| 0.369999999999831 | 0.005 | -2.771 | -9.887 |
| 0.379999999999831 | 0.006 | -2.771 | -9.887 |
| 0.389999999999831 | 0.006 | -2.771 | -9.887 |
| 0.399999999999831 | 0.007 | -2.771 | -9.887 |
| 0.409999999999831 | 0.008 | -2.771 | -9.887 |
| 0.419999999999831 | 0.009 | -2.771 | -9.887 |
| 0.429999999999831 | 0.01 | -2.77 | -9.887 |
| 0.439999999999831 | 0.011 | -2.77 | -9.886 |
| 0.449999999999831 | 0.012 | -2.77 | -9.886 |
| 0.459999999999831 | 0.013 | -2.77 | -9.886 |
| 0.469999999999831 | 0.014 | -2.769 | -9.886 |
| 0.479999999999831 | 0.016 | -2.769 | -9.886 |
| 0.489999999999831 | 0.017 | -2.769 | -9.886 |
| 0.499999999999831 | 0.019 | -2.769 | -9.886 |
| 0.509999999999831 | 0.021 | -2.768 | -9.886 |
| 0.519999999999831 | 0.022 | -2.768 | -9.885 |
| 0.529999999999831 | 0.024 | -2.767 | -9.885 |
| 0.539999999999831 | 0.027 | -2.767 | -9.885 |
| 0.549999999999831 | 0.029 | -2.767 | -9.885 |
| 0.559999999999831 | 0.031 | -2.766 | -9.885 |
| 0.569999999999831 | 0.034 | -2.766 | -9.885 |
| 0.579999999999831 | 0.037 | -2.765 | -9.884 |
| 0.589999999999831 | 0.04 | -2.765 | -9.884 |
| 0.599999999999831 | 0.043 | -2.764 | -9.884 |
| 0.609999999999831 | 0.047 | -2.763 | -9.884 |
| 0.619999999999831 | 0.05 | -2.763 | -9.883 |
| 0.629999999999831 | 0.054 | -2.762 | -9.883 |
| 0.639999999999831 | 0.059 | -2.761 | -9.883 |
| 0.649999999999831 | 0.063 | -2.761 | -9.882 |
| 0.659999999999831 | 0.068 | -2.76 | -9.882 |
| 0.669999999999831 | 0.073 | -2.759 | -9.882 |
| 0.679999999999831 | 0.079 | -2.758 | -9.881 |
| 0.689999999999831 | 0.085 | -2.757 | -9.881 |
| 0.699999999999831 | 0.092 | -2.756 | -9.881 |
| 0.709999999999831 | 0.099 | -2.755 | -9.88 |
| 0.719999999999831 | 0.106 | -2.754 | -9.88 |
| 0.729999999999831 | 0.114 | -2.753 | -9.879 |
| 0.739999999999831 | 0.123 | -2.752 | -9.879 |
| 0.749999999999832 | 0.132 | -2.751 | -9.878 |
| 0.759999999999832 | 0.142 | -2.749 | -9.878 |
| 0.769999999999832 | 0.153 | -2.748 | -9.877 |
| 0.779999999999832 | 0.165 | -2.747 | -9.877 |
| 0.789999999999832 | 0.177 | -2.745 | -9.876 |
| 0.799999999999832 | 0.191 | -2.744 | -9.876 |
| 0.809999999999832 | 0.206 | -2.742 | -9.875 |
| 0.819999999999832 | 0.222 | -2.741 | -9.874 |
| 0.829999999999832 | 0.239 | -2.739 | -9.874 |
| 0.839999999999832 | 0.259 | -2.737 | -9.873 |
| 0.849999999999832 | 0.28 | -2.735 | -9.872 |
| 0.859999999999832 | 0.303 | -2.733 | -9.871 |
| 0.869999999999832 | 0.329 | -2.732 | -9.871 |
| 0.879999999999832 | 0.357 | -2.729 | -9.87 |
| 0.889999999999832 | 0.389 | -2.727 | -9.869 |
| 0.899999999999832 | 0.425 | -2.725 | -9.868 |
| 0.909999999999832 | 0.466 | -2.723 | -9.867 |
| 0.919999999999832 | 0.514 | -2.72 | -9.866 |
| 0.929999999999832 | 0.568 | -2.718 | -9.865 |
| 0.939999999999832 | 0.634 | -2.715 | -9.864 |
| 0.949999999999832 | 0.713 | -2.712 | -9.863 |
| 0.959999999999832 | 0.812 | -2.71 | -9.862 |
| 0.969999999999832 | 0.944 | -2.707 | -9.861 |
| 0.979999999999832 | 1.134 | -2.704 | -9.86 |
| 0.989999999999832 | 1.468 | -2.7 | -9.859 |
| 0.999999999999832 | 100 | -2.697 | -9.857 |
| 1.009999999999832 | 1.443 | -2.694 | -9.856 |
| 1.019999999999832 | 1.084 | -2.69 | -9.855 |
| 1.029999999999832 | 0.869 | -2.687 | -9.854 |
| 1.039999999999832 | 0.712 | -2.683 | -9.852 |
| 1.049999999999832 | 0.588 | -2.679 | -9.851 |
| 1.059999999999832 | 0.484 | -2.675 | -9.849 |
| 1.069999999999832 | 0.393 | -2.671 | -9.848 |
| 1.079999999999832 | 0.313 | -2.666 | -9.846 |
| 1.089999999999832 | 0.241 | -2.662 | -9.844 |
| 1.099999999999832 | 0.175 | -2.657 | -9.843 |
| 1.109999999999832 | 0.114 | -2.652 | -9.841 |
| 1.119999999999832 | 0.057 | -2.647 | -9.839 |
| 1.129999999999832 | 0.004 | -2.642 | -9.837 |
| 1.139999999999832 | -0.047 | -2.637 | -9.836 |
| 1.149999999999832 | -0.095 | -2.631 | -9.834 |
| 1.159999999999832 | -0.142 | -2.625 | -9.832 |
| 1.169999999999832 | -0.186 | -2.619 | -9.829 |
| 1.179999999999832 | -0.228 | -2.613 | -9.827 |
| 1.189999999999832 | -0.27 | -2.607 | -9.825 |
| 1.199999999999832 | -0.31 | -2.6 | -9.823 |
| 1.209999999999832 | -0.348 | -2.593 | -9.821 |
| 1.219999999999832 | -0.386 | -2.586 | -9.818 |
| 1.229999999999832 | -0.423 | -2.579 | -9.816 |
| 1.239999999999832 | -0.458 | -2.571 | -9.813 |
| 1.249999999999832 | -0.494 | -2.563 | -9.811 |
| 1.259999999999832 | -0.528 | -2.555 | -9.808 |
| 1.269999999999832 | -0.562 | -2.547 | -9.805 |
| 1.279999999999832 | -0.595 | -2.538 | -9.802 |
| 1.289999999999832 | -0.627 | -2.529 | -9.8 |
| 1.299999999999832 | -0.659 | -2.519 | -9.797 |
| 1.309999999999832 | -0.691 | -2.51 | -9.794 |
| 1.319999999999832 | -0.722 | -2.5 | -9.79 |
| 1.329999999999832 | -0.753 | -2.489 | -9.787 |
| 1.339999999999832 | -0.783 | -2.479 | -9.784 |
| 1.349999999999832 | -0.814 | -2.468 | -9.781 |
| 1.359999999999832 | -0.843 | -2.456 | -9.777 |
| 1.369999999999832 | -0.873 | -2.444 | -9.773 |
| 1.379999999999832 | -0.902 | -2.432 | -9.77 |
| 1.389999999999832 | -0.931 | -2.419 | -9.766 |
| 1.399999999999832 | -0.96 | -2.406 | -9.762 |
| 1.409999999999832 | -0.988 | -2.392 | -9.758 |
| 1.419999999999832 | -1.016 | -2.378 | -9.754 |
| 1.429999999999832 | -1.044 | -2.363 | -9.75 |
| 1.439999999999832 | -1.072 | -2.348 | -9.746 |
| 1.449999999999832 | -1.1 | -2.332 | -9.741 |
| 1.459999999999832 | -1.128 | -2.316 | -9.737 |
| 1.469999999999832 | -1.155 | -2.299 | -9.732 |
| 1.479999999999832 | -1.182 | -2.281 | -9.728 |
| 1.489999999999832 | -1.21 | -2.263 | -9.723 |
| 1.499999999999832 | -1.237 | -2.244 | -9.718 |
| 1.509999999999832 | -1.264 | -2.225 | -9.713 |
| 1.519999999999832 | -1.29 | -2.204 | -9.708 |
| 1.529999999999832 | -1.317 | -2.183 | -9.702 |
| 1.539999999999832 | -1.344 | -2.161 | -9.697 |
| 1.549999999999832 | -1.37 | -2.138 | -9.691 |
| 1.559999999999832 | -1.397 | -2.114 | -9.686 |
| 1.569999999999832 | -1.423 | -2.09 | -9.68 |
| 1.579999999999832 | -1.45 | -2.064 | -9.674 |
| 1.589999999999832 | -1.476 | -2.037 | -9.668 |
| 1.599999999999832 | -1.502 | -2.009 | -9.661 |
| 1.609999999999832 | -1.529 | -1.98 | -9.655 |
| 1.619999999999832 | -1.555 | -1.95 | -9.648 |
| 1.629999999999832 | -1.581 | -1.918 | -9.642 |
| 1.639999999999832 | -1.607 | -1.885 | -9.635 |
| 1.649999999999832 | -1.633 | -1.851 | -9.628 |
| 1.659999999999832 | -1.659 | -1.815 | -9.62 |
| 1.669999999999832 | -1.685 | -1.778 | -9.613 |
| 1.679999999999832 | -1.711 | -1.738 | -9.605 |
| 1.689999999999832 | -1.737 | -1.697 | -9.598 |
| 1.699999999999832 | -1.763 | -1.654 | -9.59 |
| 1.709999999999832 | -1.789 | -1.608 | -9.582 |
| 1.719999999999832 | -1.815 | -1.561 | -9.573 |
| 1.729999999999832 | -1.841 | -1.511 | -9.565 |
| 1.739999999999832 | -1.867 | -1.458 | -9.556 |
| 1.749999999999832 | -1.893 | -1.402 | -9.547 |
| 1.759999999999832 | -1.919 | -1.343 | -9.538 |
| 1.769999999999832 | -1.945 | -1.281 | -9.529 |
| 1.779999999999832 | -1.971 | -1.215 | -9.519 |
| 1.789999999999832 | -1.997 | -1.145 | -9.509 |
| 1.799999999999832 | -2.023 | -1.071 | -9.499 |
| 1.809999999999832 | -2.049 | -0.992 | -9.489 |
| 1.819999999999832 | -2.075 | -0.907 | -9.478 |
| 1.829999999999832 | -2.101 | -0.816 | -9.468 |
| 1.839999999999832 | -2.128 | -0.719 | -9.457 |
| 1.849999999999832 | -2.154 | -0.613 | -9.446 |
| 1.859999999999832 | -2.18 | -0.499 | -9.434 |
| 1.869999999999832 | -2.206 | -0.375 | -9.422 |
| 1.879999999999832 | -2.232 | -0.238 | -9.41 |
| 1.889999999999832 | -2.258 | -0.088 | -9.398 |
| 1.899999999999832 | -2.285 | 0.078 | -9.385 |
| 1.909999999999832 | -2.311 | 0.265 | -9.373 |
| 1.919999999999832 | -2.337 | 0.476 | -9.359 |
| 1.929999999999832 | -2.364 | 0.719 | -9.346 |
| 1.939999999999832 | -2.39 | 1.003 | -9.332 |
| 1.949999999999833 | -2.417 | 1.343 | -9.318 |
| 1.959999999999833 | -2.443 | 1.764 | -9.304 |
| 1.969999999999833 | -2.47 | 2.315 | -9.289 |
| 1.979999999999833 | -2.496 | 3.101 | -9.274 |
| 1.989999999999833 | -2.523 | 4.463 | -9.258 |
| 1.999999999999833 | -2.549 | 54.064 | -9.242 |
| 2.009999999999832 | -2.576 | 4.413 | -9.226 |
| 2.019999999999832 | -2.603 | 3.001 | -9.21 |
| 2.029999999999832 | -2.63 | 2.165 | -9.193 |
| 2.039999999999832 | -2.656 | 1.564 | -9.175 |
| 2.049999999999832 | -2.683 | 1.093 | -9.158 |
| 2.059999999999831 | -2.71 | 0.703 | -9.14 |
| 2.069999999999831 | -2.737 | 0.369 | -9.121 |
| 2.079999999999831 | -2.764 | 0.076 | -9.102 |
| 2.089999999999831 | -2.791 | -0.185 | -9.082 |
| 2.09999999999983 | -2.818 | -0.422 | -9.062 |
| 2.10999999999983 | -2.846 | -0.638 | -9.042 |
| 2.11999999999983 | -2.873 | -0.838 | -9.021 |
| 2.12999999999983 | -2.9 | -1.025 | -9 |
| 2.13999999999983 | -2.927 | -1.199 | -8.978 |
| 2.149999999999829 | -2.955 | -1.363 | -8.955 |
| 2.159999999999829 | -2.982 | -1.519 | -8.932 |
| 2.169999999999829 | -3.01 | -1.666 | -8.909 |
| 2.179999999999829 | -3.037 | -1.807 | -8.885 |
| 2.189999999999829 | -3.065 | -1.942 | -8.86 |
| 2.199999999999828 | -3.093 | -2.071 | -8.835 |
| 2.209999999999828 | -3.12 | -2.196 | -8.809 |
| 2.219999999999828 | -3.148 | -2.316 | -8.782 |
| 2.229999999999828 | -3.176 | -2.432 | -8.755 |
| 2.239999999999827 | -3.204 | -2.544 | -8.727 |
| 2.249999999999827 | -3.232 | -2.652 | -8.699 |
| 2.259999999999827 | -3.26 | -2.758 | -8.669 |
| 2.269999999999827 | -3.288 | -2.861 | -8.639 |
| 2.279999999999827 | -3.317 | -2.961 | -8.609 |
| 2.289999999999826 | -3.345 | -3.059 | -8.577 |
| 2.299999999999826 | -3.373 | -3.154 | -8.545 |
| 2.309999999999826 | -3.402 | -3.248 | -8.511 |
| 2.319999999999826 | -3.43 | -3.339 | -8.477 |
| 2.329999999999825 | -3.459 | -3.428 | -8.442 |
| 2.339999999999825 | -3.487 | -3.516 | -8.406 |
| 2.349999999999825 | -3.516 | -3.602 | -8.37 |
| 2.359999999999825 | -3.545 | -3.686 | -8.332 |
| 2.369999999999825 | -3.573 | -3.769 | -8.293 |
| 2.379999999999824 | -3.602 | -3.851 | -8.253 |
| 2.389999999999824 | -3.631 | -3.931 | -8.212 |
| 2.399999999999824 | -3.66 | -4.011 | -8.17 |
| 2.409999999999824 | -3.689 | -4.089 | -8.127 |
| 2.419999999999824 | -3.718 | -4.165 | -8.082 |
| 2.429999999999823 | -3.748 | -4.241 | -8.037 |
| 2.439999999999823 | -3.777 | -4.316 | -7.99 |
| 2.449999999999823 | -3.806 | -4.39 | -7.941 |
| 2.459999999999823 | -3.836 | -4.463 | -7.891 |
| 2.469999999999823 | -3.865 | -4.535 | -7.84 |
| 2.479999999999822 | -3.895 | -4.607 | -7.788 |
| 2.489999999999822 | -3.924 | -4.677 | -7.733 |
| 2.499999999999822 | -3.954 | -4.747 | -7.677 |
| 2.509999999999822 | -3.984 | -4.816 | -7.62 |
| 2.519999999999821 | -4.014 | -4.884 | -7.56 |
| 2.529999999999821 | -4.044 | -4.952 | -7.499 |
| 2.539999999999821 | -4.074 | -5.019 | -7.435 |
| 2.549999999999821 | -4.104 | -5.086 | -7.37 |
| 2.559999999999821 | -4.134 | -5.152 | -7.303 |
| 2.56999999999982 | -4.164 | -5.217 | -7.233 |
| 2.57999999999982 | -4.195 | -5.282 | -7.161 |
| 2.58999999999982 | -4.225 | -5.347 | -7.086 |
| 2.59999999999982 | -4.255 | -5.41 | -7.009 |
| 2.609999999999819 | -4.286 | -5.474 | -6.929 |
| 2.619999999999819 | -4.317 | -5.537 | -6.847 |
| 2.629999999999819 | -4.347 | -5.599 | -6.761 |
| 2.639999999999819 | -4.378 | -5.662 | -6.672 |
| 2.649999999999819 | -4.409 | -5.723 | -6.58 |
| 2.659999999999818 | -4.44 | -5.785 | -6.484 |
| 2.669999999999818 | -4.471 | -5.846 | -6.384 |
| 2.679999999999818 | -4.502 | -5.906 | -6.28 |
| 2.689999999999818 | -4.533 | -5.967 | -6.172 |
| 2.699999999999818 | -4.564 | -6.027 | -6.059 |
| 2.709999999999817 | -4.596 | -6.086 | -5.942 |
| 2.719999999999817 | -4.627 | -6.146 | -5.819 |
| 2.729999999999817 | -4.659 | -6.205 | -5.69 |
| 2.739999999999817 | -4.69 | -6.264 | -5.556 |
| 2.749999999999817 | -4.722 | -6.322 | -5.414 |
| 2.759999999999816 | -4.754 | -6.38 | -5.266 |
| 2.769999999999816 | -4.785 | -6.438 | -5.11 |
| 2.779999999999816 | -4.817 | -6.496 | -4.945 |
| 2.789999999999816 | -4.849 | -6.554 | -4.772 |
| 2.799999999999815 | -4.881 | -6.611 | -4.588 |
| 2.809999999999815 | -4.914 | -6.668 | -4.393 |
| 2.819999999999815 | -4.946 | -6.725 | -4.185 |
| 2.829999999999815 | -4.978 | -6.781 | -3.964 |
| 2.839999999999815 | -5.01 | -6.838 | -3.727 |
| 2.849999999999814 | -5.043 | -6.894 | -3.473 |
| 2.859999999999814 | -5.075 | -6.95 | -3.199 |
| 2.869999999999814 | -5.108 | -7.006 | -2.902 |
| 2.879999999999814 | -5.141 | -7.062 | -2.578 |
| 2.889999999999814 | -5.174 | -7.117 | -2.223 |
| 2.899999999999813 | -5.206 | -7.173 | -1.831 |
| 2.909999999999813 | -5.239 | -7.228 | -1.393 |
| 2.919999999999813 | -5.272 | -7.283 | -0.9 |
| 2.929999999999813 | -5.306 | -7.338 | -0.336 |
| 2.939999999999813 | -5.339 | -7.393 | 0.321 |
| 2.949999999999812 | -5.372 | -7.447 | 1.104 |
| 2.959999999999812 | -5.405 | -7.502 | 2.071 |
| 2.969999999999812 | -5.439 | -7.556 | 3.329 |
| 2.979999999999812 | -5.472 | -7.611 | 5.116 |
| 2.989999999999811 | -5.506 | -7.665 | 8.198 |
| 2.999999999999811 | -5.54 | -7.719 | 119.276 |
| 3.009999999999811 | -5.574 | -7.773 | 8.123 |
| 3.019999999999811 | -5.607 | -7.827 | 4.966 |
| 3.029999999999811 | -5.641 | -7.88 | 3.104 |
| 3.03999999999981 | -5.675 | -7.934 | 1.771 |
| 3.04999999999981 | -5.71 | -7.988 | 0.729 |
| 3.05999999999981 | -5.744 | -8.041 | -0.129 |
| 3.06999999999981 | -5.778 | -8.094 | -0.861 |
| 3.07999999999981 | -5.812 | -8.148 | -1.5 |
| 3.089999999999809 | -5.847 | -8.201 | -2.068 |
| 3.099999999999809 | -5.881 | -8.254 | -2.581 |
| 3.109999999999809 | -5.916 | -8.307 | -3.048 |
| 3.119999999999809 | -5.951 | -8.36 | -3.478 |
| 3.129999999999808 | -5.986 | -8.413 | -3.877 |
| 3.139999999999808 | -6.021 | -8.466 | -4.249 |
| 3.149999999999808 | -6.056 | -8.519 | -4.598 |
| 3.159999999999808 | -6.091 | -8.572 | -4.928 |
| 3.169999999999808 | -6.126 | -8.624 | -5.239 |
| 3.179999999999807 | -6.161 | -8.677 | -5.536 |
| 3.189999999999807 | -6.196 | -8.729 | -5.818 |
| 3.199999999999807 | -6.232 | -8.782 | -6.088 |
| 3.209999999999807 | -6.267 | -8.834 | -6.347 |
| 3.219999999999807 | -6.303 | -8.887 | -6.596 |
| 3.229999999999806 | -6.339 | -8.939 | -6.835 |
| 3.239999999999806 | -6.374 | -8.992 | -7.066 |
| 3.249999999999806 | -6.41 | -9.044 | -7.29 |
| 3.259999999999806 | -6.446 | -9.096 | -7.506 |
| 3.269999999999805 | -6.482 | -9.149 | -7.715 |
| 3.279999999999805 | -6.518 | -9.201 | -7.919 |
| 3.289999999999805 | -6.554 | -9.253 | -8.117 |
| 3.299999999999805 | -6.591 | -9.305 | -8.31 |
| 3.309999999999805 | -6.627 | -9.357 | -8.497 |
| 3.319999999999804 | -6.664 | -9.409 | -8.68 |
| 3.329999999999804 | -6.7 | -9.462 | -8.859 |
| 3.339999999999804 | -6.737 | -9.514 | -9.034 |
| 3.349999999999804 | -6.774 | -9.566 | -9.205 |
| 3.359999999999804 | -6.81 | -9.618 | -9.372 |
| 3.369999999999803 | -6.847 | -9.67 | -9.537 |
| 3.379999999999803 | -6.884 | -9.722 | -9.697 |
| 3.389999999999803 | -6.921 | -9.774 | -9.855 |
| 3.399999999999803 | -6.959 | -9.826 | -10.01 |
| 3.409999999999802 | -6.996 | -9.878 | -10.162 |
| 3.419999999999802 | -7.033 | -9.93 | -10.312 |
| 3.429999999999802 | -7.071 | -9.982 | -10.459 |
| 3.439999999999802 | -7.108 | -10.034 | -10.604 |
| 3.449999999999802 | -7.146 | -10.086 | -10.746 |
| 3.459999999999801 | -7.183 | -10.138 | -10.887 |
| 3.469999999999801 | -7.221 | -10.19 | -11.025 |
| 3.479999999999801 | -7.259 | -10.241 | -11.162 |
| 3.489999999999801 | -7.297 | -10.293 | -11.296 |
| 3.499999999999801 | -7.335 | -10.345 | -11.429 |
| 3.5099999999998 | -7.373 | -10.397 | -11.56 |
| 3.5199999999998 | -7.412 | -10.449 | -11.689 |
| 3.5299999999998 | -7.45 | -10.501 | -11.817 |
| 3.5399999999998 | -7.488 | -10.553 | -11.944 |
| 3.5499999999998 | -7.527 | -10.605 | -12.069 |
| 3.559999999999799 | -7.565 | -10.657 | -12.192 |
| 3.569999999999799 | -7.604 | -10.709 | -12.314 |
| 3.579999999999799 | -7.643 | -10.761 | -12.435 |
| 3.589999999999799 | -7.682 | -10.813 | -12.555 |
| 3.599999999999798 | -7.721 | -10.866 | -12.673 |
| 3.609999999999798 | -7.76 | -10.918 | -12.79 |
| 3.619999999999798 | -7.799 | -10.97 | -12.906 |
| 3.629999999999798 | -7.838 | -11.022 | -13.022 |
| 3.639999999999798 | -7.878 | -11.074 | -13.136 |
| 3.649999999999797 | -7.917 | -11.126 | -13.249 |
| 3.659999999999797 | -7.956 | -11.178 | -13.361 |
| 3.669999999999797 | -7.996 | -11.23 | -13.472 |
| 3.679999999999797 | -8.036 | -11.283 | -13.582 |
| 3.689999999999796 | -8.076 | -11.335 | -13.691 |
| 3.699999999999796 | -8.115 | -11.387 | -13.799 |
| 3.709999999999796 | -8.155 | -11.439 | -13.907 |
| 3.719999999999796 | -8.195 | -11.492 | -14.014 |
| 3.729999999999796 | -8.236 | -11.544 | -14.12 |
| 3.739999999999795 | -8.276 | -11.596 | -14.225 |
| 3.749999999999795 | -8.316 | -11.649 | -14.33 |
| 3.759999999999795 | -8.357 | -11.701 | -14.433 |
| 3.769999999999795 | -8.397 | -11.754 | -14.537 |
| 3.779999999999795 | -8.438 | -11.806 | -14.639 |
| 3.789999999999794 | -8.478 | -11.859 | -14.741 |
| 3.799999999999794 | -8.519 | -11.911 | -14.842 |
| 3.809999999999794 | -8.56 | -11.964 | -14.943 |
| 3.819999999999794 | -8.601 | -12.016 | -15.043 |
| 3.829999999999794 | -8.642 | -12.069 | -15.142 |
| 3.839999999999793 | -8.683 | -12.122 | -15.241 |
| 3.849999999999793 | -8.724 | -12.175 | -15.339 |
| 3.859999999999793 | -8.766 | -12.227 | -15.437 |
| 3.869999999999793 | -8.807 | -12.28 | -15.534 |
| 3.879999999999792 | -8.849 | -12.333 | -15.631 |
| 3.889999999999792 | -8.89 | -12.386 | -15.727 |
| 3.899999999999792 | -8.932 | -12.439 | -15.823 |
| 3.909999999999792 | -8.974 | -12.492 | -15.918 |
| 3.919999999999792 | -9.016 | -12.545 | -16.013 |
| 3.929999999999791 | -9.058 | -12.598 | -16.107 |
| 3.939999999999791 | -9.1 | -12.651 | -16.201 |
| 3.949999999999791 | -9.142 | -12.704 | -16.295 |
| 3.959999999999791 | -9.184 | -12.757 | -16.388 |
| 3.969999999999791 | -9.226 | -12.81 | -16.481 |
| 3.97999999999979 | -9.269 | -12.863 | -16.573 |
| 3.98999999999979 | -9.311 | -12.917 | -16.665 |
| 3.99999999999979 | -9.354 | -12.97 | -16.757 |
| 4.00999999999979 | -9.397 | -13.023 | -16.848 |
| 4.01999999999979 | -9.44 | -13.077 | -16.939 |
| 4.02999999999979 | -9.482 | -13.13 | -17.029 |
| 4.03999999999979 | -9.525 | -13.184 | -17.12 |
| 4.04999999999979 | -9.569 | -13.237 | -17.209 |
| 4.05999999999979 | -9.612 | -13.291 | -17.299 |
| 4.069999999999789 | -9.655 | -13.344 | -17.388 |
| 4.079999999999788 | -9.698 | -13.398 | -17.477 |
| 4.089999999999788 | -9.742 | -13.452 | -17.566 |
| 4.099999999999788 | -9.785 | -13.505 | -17.654 |
| 4.109999999999788 | -9.829 | -13.559 | -17.742 |
| 4.119999999999788 | -9.873 | -13.613 | -17.83 |
| 4.129999999999788 | -9.917 | -13.667 | -17.918 |
| 4.139999999999787 | -9.96 | -13.721 | -18.005 |
| 4.149999999999787 | -10.004 | -13.775 | -18.092 |
| 4.159999999999787 | -10.049 | -13.829 | -18.179 |
| 4.169999999999787 | -10.093 | -13.883 | -18.266 |
| 4.179999999999786 | -10.137 | -13.937 | -18.352 |
| 4.189999999999786 | -10.181 | -13.992 | -18.438 |
| 4.199999999999786 | -10.226 | -14.046 | -18.524 |
| 4.209999999999785 | -10.27 | -14.1 | -18.609 |
| 4.219999999999785 | -10.315 | -14.155 | -18.695 |
| 4.229999999999785 | -10.36 | -14.209 | -18.78 |
| 4.239999999999785 | -10.405 | -14.264 | -18.865 |
| 4.249999999999785 | -10.45 | -14.318 | -18.95 |
| 4.259999999999784 | -10.495 | -14.373 | -19.035 |
| 4.269999999999784 | -10.54 | -14.428 | -19.119 |
| 4.279999999999784 | -10.585 | -14.482 | -19.203 |
| 4.289999999999784 | -10.63 | -14.537 | -19.287 |
| 4.299999999999784 | -10.676 | -14.592 | -19.371 |
| 4.309999999999784 | -10.721 | -14.647 | -19.455 |
| 4.319999999999784 | -10.767 | -14.702 | -19.538 |
| 4.329999999999783 | -10.813 | -14.757 | -19.622 |
| 4.339999999999783 | -10.858 | -14.812 | -19.705 |
| 4.349999999999783 | -10.904 | -14.867 | -19.788 |
| 4.359999999999783 | -10.95 | -14.922 | -19.871 |
| 4.369999999999782 | -10.996 | -14.977 | -19.953 |
| 4.379999999999782 | -11.042 | -15.033 | -20.036 |
| 4.389999999999782 | -11.089 | -15.088 | -20.118 |
| 4.399999999999782 | -11.135 | -15.144 | -20.201 |
| 4.409999999999781 | -11.182 | -15.199 | -20.283 |
| 4.419999999999781 | -11.228 | -15.255 | -20.365 |
| 4.429999999999781 | -11.275 | -15.31 | -20.447 |
| 4.43999999999978 | -11.321 | -15.366 | -20.529 |
| 4.44999999999978 | -11.368 | -15.422 | -20.61 |
| 4.45999999999978 | -11.415 | -15.477 | -20.692 |
| 4.46999999999978 | -11.462 | -15.533 | -20.773 |
| 4.47999999999978 | -11.509 | -15.589 | -20.854 |
| 4.48999999999978 | -11.556 | -15.645 | -20.936 |
| 4.49999999999978 | -11.604 | -15.701 | -21.017 |
| 4.50999999999978 | -11.651 | -15.757 | -21.098 |
| 4.51999999999978 | -11.699 | -15.813 | -21.178 |
| 4.52999999999978 | -11.746 | -15.87 | -21.259 |
| 4.539999999999778 | -11.794 | -15.926 | -21.34 |
| 4.549999999999778 | -11.842 | -15.982 | -21.42 |
| 4.559999999999778 | -11.889 | -16.039 | -21.501 |
| 4.569999999999778 | -11.937 | -16.095 | -21.581 |
| 4.579999999999778 | -11.985 | -16.152 | -21.661 |
| 4.589999999999777 | -12.034 | -16.208 | -21.742 |
| 4.599999999999777 | -12.082 | -16.265 | -21.822 |
| 4.609999999999777 | -12.13 | -16.322 | -21.902 |
| 4.619999999999777 | -12.179 | -16.379 | -21.982 |
| 4.629999999999777 | -12.227 | -16.436 | -22.061 |
| 4.639999999999776 | -12.276 | -16.493 | -22.141 |
| 4.649999999999776 | -12.324 | -16.55 | -22.221 |
| 4.659999999999776 | -12.373 | -16.607 | -22.301 |
| 4.669999999999776 | -12.422 | -16.664 | -22.38 |
| 4.679999999999775 | -12.471 | -16.721 | -22.46 |
| 4.689999999999775 | -12.52 | -16.778 | -22.539 |
| 4.699999999999775 | -12.569 | -16.836 | -22.618 |
| 4.709999999999775 | -12.619 | -16.893 | -22.698 |
| 4.719999999999774 | -12.668 | -16.951 | -22.777 |
| 4.729999999999774 | -12.718 | -17.008 | -22.856 |
| 4.739999999999774 | -12.767 | -17.066 | -22.935 |
| 4.749999999999774 | -12.817 | -17.124 | -23.014 |
| 4.759999999999774 | -12.866 | -17.181 | -23.093 |
| 4.769999999999774 | -12.916 | -17.239 | -23.172 |
| 4.779999999999773 | -12.966 | -17.297 | -23.251 |
| 4.789999999999773 | -13.016 | -17.355 | -23.33 |
| 4.799999999999773 | -13.066 | -17.413 | -23.409 |
| 4.809999999999773 | -13.117 | -17.471 | -23.487 |
| 4.819999999999773 | -13.167 | -17.529 | -23.566 |
| 4.829999999999773 | -13.217 | -17.588 | -23.645 |
| 4.839999999999772 | -13.268 | -17.646 | -23.723 |
| 4.849999999999772 | -13.319 | -17.704 | -23.802 |
| 4.859999999999772 | -13.369 | -17.763 | -23.88 |
| 4.869999999999772 | -13.42 | -17.821 | -23.959 |
| 4.879999999999771 | -13.471 | -17.88 | -24.037 |
| 4.889999999999771 | -13.522 | -17.939 | -24.116 |
| 4.899999999999771 | -13.573 | -17.997 | -24.194 |
| 4.90999999999977 | -13.624 | -18.056 | -24.273 |
| 4.91999999999977 | -13.675 | -18.115 | -24.351 |
| 4.92999999999977 | -13.727 | -18.174 | -24.429 |
| 4.93999999999977 | -13.778 | -18.233 | -24.508 |
| 4.94999999999977 | -13.83 | -18.292 | -24.586 |
| 4.95999999999977 | -13.881 | -18.352 | -24.664 |
| 4.96999999999977 | -13.933 | -18.411 | -24.742 |
| 4.97999999999977 | -13.985 | -18.47 | -24.82 |
| 4.98999999999977 | -14.037 | -18.53 | -24.899 |
| 4.99999999999977 | -14.089 | -18.589 | -24.977 |
| 5.009999999999768 | -14.141 | -18.649 | -25.055 |
| 5.019999999999768 | -14.193 | -18.708 | -25.133 |
| 5.029999999999768 | -14.246 | -18.768 | -25.211 |
| 5.039999999999768 | -14.298 | -18.828 | -25.289 |
| 5.049999999999767 | -14.351 | -18.888 | -25.367 |
| 5.059999999999767 | -14.403 | -18.948 | -25.445 |
| 5.069999999999767 | -14.456 | -19.008 | -25.523 |
| 5.079999999999767 | -14.509 | -19.068 | -25.601 |
| 5.089999999999767 | -14.562 | -19.128 | -25.679 |
| 5.099999999999766 | -14.615 | -19.188 | -25.757 |
| 5.109999999999766 | -14.668 | -19.248 | -25.835 |
| 5.119999999999766 | -14.721 | -19.309 | -25.913 |
| 5.129999999999766 | -14.774 | -19.369 | -25.991 |
| 5.139999999999766 | -14.828 | -19.43 | -26.069 |
| 5.149999999999765 | -14.881 | -19.49 | -26.147 |
| 5.159999999999765 | -14.935 | -19.551 | -26.225 |
| 5.169999999999765 | -14.988 | -19.612 | -26.303 |
| 5.179999999999765 | -15.042 | -19.673 | -26.381 |
| 5.189999999999764 | -15.096 | -19.733 | -26.459 |
| 5.199999999999764 | -15.15 | -19.794 | -26.537 |
| 5.209999999999764 | -15.204 | -19.856 | -26.615 |
| 5.219999999999764 | -15.258 | -19.917 | -26.693 |
| 5.229999999999764 | -15.312 | -19.978 | -26.77 |
| 5.239999999999763 | -15.367 | -20.039 | -26.848 |
| 5.249999999999763 | -15.421 | -20.101 | -26.926 |
| 5.259999999999763 | -15.476 | -20.162 | -27.004 |
| 5.269999999999763 | -15.53 | -20.224 | -27.082 |
| 5.279999999999763 | -15.585 | -20.285 | -27.16 |
| 5.289999999999762 | -15.64 | -20.347 | -27.238 |
| 5.299999999999762 | -15.695 | -20.409 | -27.316 |
| 5.309999999999762 | -15.75 | -20.47 | -27.394 |
| 5.319999999999762 | -15.805 | -20.532 | -27.472 |
| 5.329999999999762 | -15.86 | -20.594 | -27.55 |
| 5.339999999999761 | -15.915 | -20.656 | -27.628 |
| 5.349999999999761 | -15.971 | -20.719 | -27.706 |
| 5.359999999999761 | -16.026 | -20.781 | -27.784 |
| 5.369999999999761 | -16.082 | -20.843 | -27.862 |
| 5.37999999999976 | -16.137 | -20.905 | -27.94 |
| 5.38999999999976 | -16.193 | -20.968 | -28.019 |
| 5.39999999999976 | -16.249 | -21.031 | -28.097 |
| 5.40999999999976 | -16.305 | -21.093 | -28.175 |
| 5.41999999999976 | -16.361 | -21.156 | -28.253 |
| 5.42999999999976 | -16.417 | -21.219 | -28.331 |
| 5.43999999999976 | -16.473 | -21.281 | -28.409 |
| 5.44999999999976 | -16.53 | -21.344 | -28.487 |
| 5.45999999999976 | -16.586 | -21.407 | -28.566 |
| 5.46999999999976 | -16.643 | -21.471 | -28.644 |
| 5.479999999999758 | -16.699 | -21.534 | -28.722 |
| 5.489999999999758 | -16.756 | -21.597 | -28.8 |
| 5.499999999999758 | -16.813 | -21.66 | -28.879 |
| 5.509999999999758 | -16.87 | -21.724 | -28.957 |
| 5.519999999999758 | -16.927 | -21.787 | -29.035 |
| 5.529999999999758 | -16.984 | -21.851 | -29.114 |
| 5.539999999999757 | -17.041 | -21.914 | -29.192 |
| 5.549999999999757 | -17.099 | -21.978 | -29.27 |
| 5.559999999999757 | -17.156 | -22.042 | -29.349 |
| 5.569999999999757 | -17.213 | -22.106 | -29.427 |
| 5.579999999999756 | -17.271 | -22.17 | -29.506 |
| 5.589999999999756 | -17.329 | -22.234 | -29.584 |
| 5.599999999999756 | -17.387 | -22.298 | -29.663 |
| 5.609999999999756 | -17.444 | -22.362 | -29.741 |
| 5.619999999999756 | -17.502 | -22.427 | -29.82 |
| 5.629999999999756 | -17.561 | -22.491 | -29.898 |
| 5.639999999999755 | -17.619 | -22.556 | -29.977 |
| 5.649999999999755 | -17.677 | -22.62 | -30.056 |
| 5.659999999999755 | -17.735 | -22.685 | -30.134 |
| 5.669999999999755 | -17.794 | -22.749 | -30.213 |
| 5.679999999999754 | -17.852 | -22.814 | -30.292 |
| 5.689999999999754 | -17.911 | -22.879 | -30.371 |
| 5.699999999999754 | -17.97 | -22.944 | -30.45 |
| 5.709999999999754 | -18.029 | -23.009 | -30.528 |
| 5.719999999999754 | -18.088 | -23.074 | -30.607 |
| 5.729999999999753 | -18.147 | -23.139 | -30.686 |
| 5.739999999999753 | -18.206 | -23.205 | -30.765 |
| 5.749999999999753 | -18.265 | -23.27 | -30.844 |
| 5.759999999999753 | -18.324 | -23.336 | -30.923 |
| 5.769999999999753 | -18.384 | -23.401 | -31.002 |
| 5.779999999999752 | -18.443 | -23.467 | -31.081 |
| 5.789999999999752 | -18.503 | -23.532 | -31.161 |
| 5.799999999999752 | -18.563 | -23.598 | -31.24 |
| 5.809999999999752 | -18.623 | -23.664 | -31.319 |
| 5.819999999999752 | -18.683 | -23.73 | -31.398 |
| 5.829999999999751 | -18.743 | -23.796 | -31.477 |
| 5.839999999999751 | -18.803 | -23.862 | -31.557 |
| 5.849999999999751 | -18.863 | -23.928 | -31.636 |
| 5.859999999999751 | -18.923 | -23.995 | -31.715 |
| 5.86999999999975 | -18.984 | -24.061 | -31.795 |
| 5.87999999999975 | -19.044 | -24.128 | -31.874 |
| 5.88999999999975 | -19.105 | -24.194 | -31.954 |
| 5.89999999999975 | -19.165 | -24.261 | -32.033 |
| 5.90999999999975 | -19.226 | -24.327 | -32.113 |
| 5.91999999999975 | -19.287 | -24.394 | -32.193 |
| 5.92999999999975 | -19.348 | -24.461 | -32.272 |
| 5.93999999999975 | -19.409 | -24.528 | -32.352 |
| 5.949999999999748 | -19.47 | -24.595 | -32.432 |
| 5.959999999999748 | -19.532 | -24.662 | -32.512 |
| 5.969999999999748 | -19.593 | -24.729 | -32.591 |
| 5.979999999999748 | -19.654 | -24.797 | -32.671 |
| 5.989999999999747 | -19.716 | -24.864 | -32.751 |
| 5.999999999999747 | -19.778 | -24.931 | -32.831 |
| 6.009999999999747 | -19.839 | -24.999 | -32.911 |
| 6.019999999999747 | -19.901 | -25.067 | -32.991 |
| 6.029999999999747 | -19.963 | -25.134 | -33.071 |
| 6.039999999999746 | -20.025 | -25.202 | -33.152 |
| 6.049999999999746 | -20.087 | -25.27 | -33.232 |
| 6.059999999999746 | -20.15 | -25.338 | -33.312 |
| 6.069999999999746 | -20.212 | -25.406 | -33.392 |
| 6.079999999999746 | -20.274 | -25.474 | -33.473 |
| 6.089999999999745 | -20.337 | -25.542 | -33.553 |
| 6.099999999999745 | -20.4 | -25.611 | -33.634 |
| 6.109999999999745 | -20.462 | -25.679 | -33.714 |
| 6.119999999999745 | -20.525 | -25.748 | -33.795 |
| 6.129999999999745 | -20.588 | -25.816 | -33.875 |
| 6.139999999999744 | -20.651 | -25.885 | -33.956 |
| 6.149999999999744 | -20.714 | -25.954 | -34.036 |
| 6.159999999999744 | -20.778 | -26.022 | -34.117 |
| 6.169999999999744 | -20.841 | -26.091 | -34.198 |
| 6.179999999999744 | -20.904 | -26.16 | -34.279 |
| 6.189999999999744 | -20.968 | -26.229 | -34.36 |
| 6.199999999999743 | -21.031 | -26.298 | -34.441 |
| 6.209999999999743 | -21.095 | -26.368 | -34.522 |
| 6.219999999999743 | -21.159 | -26.437 | -34.603 |
| 6.229999999999743 | -21.223 | -26.506 | -34.684 |
| 6.239999999999742 | -21.287 | -26.576 | -34.765 |
| 6.249999999999742 | -21.351 | -26.646 | -34.846 |
| 6.259999999999742 | -21.415 | -26.715 | -34.927 |
| 6.269999999999742 | -21.479 | -26.785 | -35.009 |
| 6.279999999999741 | -21.544 | -26.855 | -35.09 |
| 6.289999999999741 | -21.608 | -26.925 | -35.171 |
| 6.299999999999741 | -21.673 | -26.995 | -35.253 |
| 6.309999999999741 | -21.737 | -27.065 | -35.334 |
| 6.319999999999741 | -21.802 | -27.135 | -35.416 |
| 6.329999999999741 | -21.867 | -27.205 | -35.497 |
| 6.33999999999974 | -21.932 | -27.276 | -35.579 |
| 6.34999999999974 | -21.997 | -27.346 | -35.661 |
| 6.35999999999974 | -22.062 | -27.417 | -35.743 |
| 6.36999999999974 | -22.128 | -27.487 | -35.824 |
| 6.37999999999974 | -22.193 | -27.558 | -35.906 |
| 6.38999999999974 | -22.258 | -27.629 | -35.988 |
| 6.39999999999974 | -22.324 | -27.7 | -36.07 |
| 6.409999999999738 | -22.39 | -27.771 | -36.152 |
| 6.419999999999738 | -22.455 | -27.842 | -36.234 |
| 6.429999999999738 | -22.521 | -27.913 | -36.317 |
| 6.439999999999738 | -22.587 | -27.984 | -36.399 |
| 6.449999999999738 | -22.653 | -28.055 | -36.481 |
| 6.459999999999737 | -22.719 | -28.127 | -36.563 |
| 6.469999999999737 | -22.786 | -28.198 | -36.646 |
| 6.479999999999737 | -22.852 | -28.27 | -36.728 |
| 6.489999999999737 | -22.918 | -28.342 | -36.811 |
| 6.499999999999737 | -22.985 | -28.413 | -36.893 |
| 6.509999999999736 | -23.051 | -28.485 | -36.976 |
| 6.519999999999736 | -23.118 | -28.557 | -37.059 |
| 6.529999999999736 | -23.185 | -28.629 | -37.141 |
| 6.539999999999736 | -23.252 | -28.701 | -37.224 |
| 6.549999999999736 | -23.319 | -28.773 | -37.307 |
| 6.559999999999735 | -23.386 | -28.846 | -37.39 |
| 6.569999999999735 | -23.453 | -28.918 | -37.473 |
| 6.579999999999735 | -23.521 | -28.99 | -37.556 |
| 6.589999999999735 | -23.588 | -29.063 | -37.639 |
| 6.599999999999734 | -23.655 | -29.136 | -37.722 |
| 6.609999999999734 | -23.723 | -29.208 | -37.805 |
| 6.619999999999734 | -23.791 | -29.281 | -37.889 |
| 6.629999999999734 | -23.859 | -29.354 | -37.972 |
| 6.639999999999734 | -23.926 | -29.427 | -38.055 |
| 6.649999999999734 | -23.994 | -29.5 | -38.139 |
| 6.659999999999734 | -24.063 | -29.573 | -38.222 |
| 6.669999999999733 | -24.131 | -29.647 | -38.306 |
| 6.679999999999733 | -24.199 | -29.72 | -38.39 |
| 6.689999999999733 | -24.267 | -29.793 | -38.473 |
| 6.699999999999733 | -24.336 | -29.867 | -38.557 |
| 6.709999999999732 | -24.404 | -29.94 | -38.641 |
| 6.719999999999732 | -24.473 | -30.014 | -38.725 |
| 6.729999999999732 | -24.542 | -30.088 | -38.809 |
| 6.739999999999731 | -24.611 | -30.162 | -38.893 |
| 6.749999999999731 | -24.68 | -30.236 | -38.977 |
| 6.759999999999731 | -24.749 | -30.31 | -39.061 |
| 6.769999999999731 | -24.818 | -30.384 | -39.145 |
| 6.77999999999973 | -24.887 | -30.458 | -39.229 |
| 6.78999999999973 | -24.957 | -30.532 | -39.314 |
| 6.79999999999973 | -25.026 | -30.607 | -39.398 |
| 6.80999999999973 | -25.096 | -30.681 | -39.483 |
| 6.81999999999973 | -25.165 | -30.756 | -39.567 |
| 6.82999999999973 | -25.235 | -30.83 | -39.652 |
| 6.83999999999973 | -25.305 | -30.905 | -39.736 |
| 6.84999999999973 | -25.375 | -30.98 | -39.821 |
| 6.85999999999973 | -25.445 | -31.055 | -39.906 |
| 6.86999999999973 | -25.515 | -31.13 | -39.991 |
| 6.879999999999728 | -25.585 | -31.205 | -40.076 |
| 6.889999999999728 | -25.655 | -31.28 | -40.161 |
| 6.899999999999728 | -25.726 | -31.356 | -40.246 |
| 6.909999999999728 | -25.796 | -31.431 | -40.331 |
| 6.919999999999728 | -25.867 | -31.506 | -40.416 |
| 6.929999999999727 | -25.938 | -31.582 | -40.501 |
| 6.939999999999727 | -26.009 | -31.658 | -40.587 |
| 6.949999999999727 | -26.08 | -31.733 | -40.672 |
| 6.959999999999727 | -26.151 | -31.809 | -40.757 |
| 6.969999999999727 | -26.222 | -31.885 | -40.843 |
| 6.979999999999726 | -26.293 | -31.961 | -40.929 |
| 6.989999999999726 | -26.364 | -32.037 | -41.014 |
| 6.999999999999726 | -26.436 | -32.113 | -41.1 |
| 7.009999999999726 | -26.507 | -32.19 | -41.186 |
| 7.019999999999726 | -26.579 | -32.266 | -41.272 |
| 7.029999999999725 | -26.65 | -32.342 | -41.358 |
| 7.039999999999725 | -26.722 | -32.419 | -41.443 |
| 7.049999999999725 | -26.794 | -32.496 | -41.53 |
| 7.059999999999725 | -26.866 | -32.572 | -41.616 |
| 7.069999999999724 | -26.938 | -32.649 | -41.702 |
| 7.079999999999724 | -27.01 | -32.726 | -41.788 |
| 7.089999999999724 | -27.083 | -32.803 | -41.874 |
| 7.099999999999724 | -27.155 | -32.88 | -41.961 |
| 7.109999999999724 | -27.228 | -32.957 | -42.047 |
| 7.119999999999724 | -27.3 | -33.034 | -42.134 |
| 7.129999999999724 | -27.373 | -33.112 | -42.22 |
| 7.139999999999723 | -27.446 | -33.189 | -42.307 |
| 7.149999999999723 | -27.518 | -33.267 | -42.394 |
| 7.159999999999723 | -27.591 | -33.344 | -42.481 |
| 7.169999999999723 | -27.665 | -33.422 | -42.568 |
| 7.179999999999722 | -27.738 | -33.5 | -42.655 |
| 7.189999999999722 | -27.811 | -33.578 | -42.742 |
| 7.199999999999722 | -27.884 | -33.656 | -42.829 |
| 7.209999999999721 | -27.958 | -33.734 | -42.916 |
| 7.219999999999721 | -28.031 | -33.812 | -43.003 |
| 7.229999999999721 | -28.105 | -33.89 | -43.09 |
| 7.23999999999972 | -28.179 | -33.969 | -43.178 |
| 7.24999999999972 | -28.253 | -34.047 | -43.265 |
| 7.25999999999972 | -28.327 | -34.125 | -43.353 |
| 7.26999999999972 | -28.401 | -34.204 | -43.44 |
| 7.27999999999972 | -28.475 | -34.283 | -43.528 |
| 7.28999999999972 | -28.549 | -34.362 | -43.616 |
| 7.29999999999972 | -28.623 | -34.44 | -43.703 |
| 7.30999999999972 | -28.698 | -34.519 | -43.791 |
| 7.31999999999972 | -28.772 | -34.598 | -43.879 |
| 7.329999999999719 | -28.847 | -34.678 | -43.967 |
| 7.33999999999972 | -28.922 | -34.757 | -44.055 |
| 7.349999999999719 | -28.997 | -34.836 | -44.143 |
| 7.359999999999719 | -29.072 | -34.916 | -44.232 |
| 7.369999999999718 | -29.147 | -34.995 | -44.32 |
| 7.379999999999718 | -29.222 | -35.075 | -44.408 |
| 7.389999999999718 | -29.297 | -35.154 | -44.497 |
| 7.399999999999718 | -29.372 | -35.234 | -44.585 |
| 7.409999999999717 | -29.448 | -35.314 | -44.674 |
| 7.419999999999717 | -29.523 | -35.394 | -44.763 |
| 7.429999999999717 | -29.599 | -35.474 | -44.851 |
| 7.439999999999717 | -29.675 | -35.554 | -44.94 |
| 7.449999999999716 | -29.75 | -35.635 | -45.029 |
| 7.459999999999716 | -29.826 | -35.715 | -45.118 |
| 7.469999999999716 | -29.902 | -35.795 | -45.207 |
| 7.479999999999716 | -29.978 | -35.876 | -45.296 |
| 7.489999999999715 | -30.055 | -35.956 | -45.385 |
| 7.499999999999715 | -30.131 | -36.037 | -45.475 |
| 7.509999999999715 | -30.207 | -36.118 | -45.564 |
| 7.519999999999715 | -30.284 | -36.199 | -45.653 |
| 7.529999999999715 | -30.36 | -36.28 | -45.743 |
| 7.539999999999714 | -30.437 | -36.361 | -45.832 |
| 7.549999999999714 | -30.514 | -36.442 | -45.922 |
| 7.559999999999714 | -30.591 | -36.523 | -46.012 |
| 7.569999999999714 | -30.668 | -36.605 | -46.101 |
| 7.579999999999714 | -30.745 | -36.686 | -46.191 |
| 7.589999999999714 | -30.822 | -36.767 | -46.281 |
| 7.599999999999714 | -30.899 | -36.849 | -46.371 |
| 7.609999999999713 | -30.977 | -36.931 | -46.461 |
| 7.619999999999713 | -31.054 | -37.013 | -46.551 |
| 7.629999999999713 | -31.132 | -37.094 | -46.642 |
| 7.639999999999713 | -31.21 | -37.176 | -46.732 |
| 7.649999999999712 | -31.287 | -37.258 | -46.822 |
| 7.659999999999712 | -31.365 | -37.341 | -46.913 |
| 7.669999999999712 | -31.443 | -37.423 | -47.003 |
| 7.679999999999712 | -31.521 | -37.505 | -47.094 |
| 7.689999999999712 | -31.599 | -37.588 | -47.184 |
| 7.699999999999711 | -31.678 | -37.67 | -47.275 |
| 7.709999999999711 | -31.756 | -37.753 | -47.366 |
| 7.719999999999711 | -31.835 | -37.836 | -47.457 |
| 7.729999999999711 | -31.913 | -37.918 | -47.548 |
| 7.73999999999971 | -31.992 | -38.001 | -47.639 |
| 7.74999999999971 | -32.071 | -38.084 | -47.73 |
| 7.75999999999971 | -32.149 | -38.167 | -47.821 |
| 7.76999999999971 | -32.228 | -38.25 | -47.912 |
| 7.77999999999971 | -32.307 | -38.334 | -48.004 |
| 7.78999999999971 | -32.387 | -38.417 | -48.095 |
| 7.79999999999971 | -32.466 | -38.5 | -48.187 |
| 7.80999999999971 | -32.545 | -38.584 | -48.278 |
| 7.819999999999709 | -32.625 | -38.668 | -48.37 |
| 7.829999999999709 | -32.704 | -38.751 | -48.462 |
| 7.839999999999708 | -32.784 | -38.835 | -48.554 |
| 7.849999999999708 | -32.864 | -38.919 | -48.645 |
| 7.859999999999708 | -32.943 | -39.003 | -48.737 |
| 7.869999999999708 | -33.023 | -39.087 | -48.829 |
| 7.879999999999707 | -33.103 | -39.171 | -48.922 |
| 7.889999999999707 | -33.184 | -39.256 | -49.014 |
| 7.899999999999707 | -33.264 | -39.34 | -49.106 |
| 7.909999999999707 | -33.344 | -39.424 | -49.198 |
| 7.919999999999706 | -33.425 | -39.509 | -49.291 |
| 7.929999999999706 | -33.505 | -39.594 | -49.383 |
| 7.939999999999706 | -33.586 | -39.678 | -49.476 |
| 7.949999999999706 | -33.666 | -39.763 | -49.569 |
| 7.959999999999705 | -33.747 | -39.848 | -49.661 |
| 7.969999999999705 | -33.828 | -39.933 | -49.754 |
| 7.979999999999705 | -33.909 | -40.018 | -49.847 |
| 7.989999999999705 | -33.99 | -40.103 | -49.94 |
| 7.999999999999705 | -34.072 | -40.189 | -50.033 |
| 8.009999999999703 | -34.153 | -40.274 | -50.126 |
| 8.019999999999705 | -34.234 | -40.36 | -50.219 |
| 8.029999999999704 | -34.316 | -40.445 | -50.313 |
| 8.039999999999704 | -34.397 | -40.531 | -50.406 |
| 8.049999999999704 | -34.479 | -40.617 | -50.499 |
| 8.059999999999704 | -34.561 | -40.702 | -50.593 |
| 8.069999999999704 | -34.643 | -40.788 | -50.687 |
| 8.079999999999703 | -34.725 | -40.874 | -50.78 |
| 8.089999999999703 | -34.807 | -40.96 | -50.874 |
| 8.099999999999701 | -34.889 | -41.047 | -50.968 |
| 8.109999999999703 | -34.971 | -41.133 | -51.062 |
| 8.119999999999703 | -35.054 | -41.219 | -51.156 |
| 8.129999999999702 | -35.136 | -41.306 | -51.25 |
| 8.139999999999702 | -35.219 | -41.392 | -51.344 |
| 8.1499999999997 | -35.302 | -41.479 | -51.438 |
| 8.1599999999997 | -35.384 | -41.566 | -51.533 |
| 8.1699999999997 | -35.467 | -41.653 | -51.627 |
| 8.1799999999997 | -35.55 | -41.74 | -51.721 |
| 8.1899999999997 | -35.633 | -41.827 | -51.816 |
| 8.1999999999997 | -35.717 | -41.914 | -51.911 |
| 8.2099999999997 | -35.8 | -42.001 | -52.005 |
| 8.2199999999997 | -35.883 | -42.088 | -52.1 |
| 8.2299999999997 | -35.967 | -42.176 | -52.195 |
| 8.2399999999997 | -36.05 | -42.263 | -52.29 |
| 8.2499999999997 | -36.134 | -42.351 | -52.385 |
| 8.2599999999997 | -36.218 | -42.439 | -52.48 |
| 8.2699999999997 | -36.302 | -42.526 | -52.575 |
| 8.2799999999997 | -36.386 | -42.614 | -52.671 |
| 8.289999999999697 | -36.47 | -42.702 | -52.766 |
| 8.299999999999699 | -36.554 | -42.79 | -52.861 |
| 8.309999999999699 | -36.638 | -42.879 | -52.957 |
| 8.319999999999698 | -36.723 | -42.967 | -53.052 |
| 8.329999999999698 | -36.807 | -43.055 | -53.148 |
| 8.339999999999698 | -36.892 | -43.144 | -53.244 |
| 8.349999999999698 | -36.976 | -43.232 | -53.34 |
| 8.359999999999697 | -37.061 | -43.321 | -53.436 |
| 8.369999999999697 | -37.146 | -43.409 | -53.532 |
| 8.379999999999695 | -37.231 | -43.498 | -53.628 |
| 8.389999999999697 | -37.316 | -43.587 | -53.724 |
| 8.399999999999697 | -37.401 | -43.676 | -53.82 |
| 8.409999999999696 | -37.486 | -43.765 | -53.916 |
| 8.419999999999696 | -37.572 | -43.854 | -54.013 |
| 8.429999999999694 | -37.657 | -43.944 | -54.109 |
| 8.439999999999696 | -37.743 | -44.033 | -54.206 |
| 8.449999999999696 | -37.828 | -44.123 | -54.302 |
| 8.459999999999695 | -37.914 | -44.212 | -54.399 |
| 8.469999999999695 | -38 | -44.302 | -54.496 |
| 8.479999999999693 | -38.086 | -44.392 | -54.593 |
| 8.489999999999695 | -38.172 | -44.481 | -54.69 |
| 8.499999999999694 | -38.258 | -44.571 | -54.787 |
| 8.509999999999694 | -38.344 | -44.661 | -54.884 |
| 8.519999999999694 | -38.431 | -44.752 | -54.981 |
| 8.529999999999694 | -38.517 | -44.842 | -55.079 |
| 8.539999999999694 | -38.604 | -44.932 | -55.176 |
| 8.549999999999693 | -38.69 | -45.022 | -55.273 |
| 8.55999999999969 | -38.777 | -45.113 | -55.371 |
| 8.56999999999969 | -38.864 | -45.204 | -55.469 |
| 8.57999999999969 | -38.951 | -45.294 | -55.566 |
| 8.58999999999969 | -39.038 | -45.385 | -55.664 |
| 8.59999999999969 | -39.125 | -45.476 | -55.762 |
| 8.60999999999969 | -39.212 | -45.567 | -55.86 |
| 8.61999999999969 | -39.3 | -45.658 | -55.958 |
| 8.62999999999969 | -39.387 | -45.749 | -56.056 |
| 8.63999999999969 | -39.474 | -45.84 | -56.154 |
| 8.64999999999969 | -39.562 | -45.932 | -56.253 |
| 8.65999999999969 | -39.65 | -46.023 | -56.351 |
| 8.66999999999969 | -39.738 | -46.115 | -56.449 |
| 8.67999999999969 | -39.826 | -46.206 | -56.548 |
| 8.68999999999969 | -39.914 | -46.298 | -56.647 |
| 8.69999999999969 | -40.002 | -46.39 | -56.745 |
| 8.70999999999969 | -40.09 | -46.482 | -56.844 |
| 8.71999999999969 | -40.178 | -46.574 | -56.943 |
| 8.72999999999969 | -40.267 | -46.666 | -57.042 |
| 8.73999999999969 | -40.355 | -46.758 | -57.141 |
| 8.74999999999969 | -40.444 | -46.85 | -57.24 |
| 8.759999999999687 | -40.532 | -46.943 | -57.339 |
| 8.769999999999689 | -40.621 | -47.035 | -57.438 |
| 8.779999999999688 | -40.71 | -47.128 | -57.538 |
| 8.789999999999688 | -40.799 | -47.22 | -57.637 |
| 8.799999999999686 | -40.888 | -47.313 | -57.737 |
| 8.809999999999688 | -40.977 | -47.406 | -57.836 |
| 8.819999999999688 | -41.067 | -47.499 | -57.936 |
| 8.829999999999687 | -41.156 | -47.592 | -58.036 |
| 8.839999999999687 | -41.246 | -47.685 | -58.136 |
| 8.849999999999685 | -41.335 | -47.778 | -58.236 |
| 8.859999999999687 | -41.425 | -47.871 | -58.336 |
| 8.869999999999687 | -41.515 | -47.965 | -58.436 |
| 8.879999999999686 | -41.605 | -48.058 | -58.536 |
| 8.889999999999686 | -41.695 | -48.152 | -58.636 |
| 8.899999999999684 | -41.785 | -48.246 | -58.737 |
| 8.909999999999686 | -41.875 | -48.339 | -58.837 |
| 8.919999999999686 | -41.965 | -48.433 | -58.938 |
| 8.929999999999685 | -42.056 | -48.527 | -59.038 |
| 8.939999999999685 | -42.146 | -48.621 | -59.139 |
| 8.949999999999685 | -42.237 | -48.715 | -59.24 |
| 8.959999999999685 | -42.327 | -48.81 | -59.341 |
| 8.969999999999684 | -42.418 | -48.904 | -59.442 |
| 8.979999999999684 | -42.509 | -48.998 | -59.543 |
| 8.989999999999682 | -42.6 | -49.093 | -59.644 |
| 8.999999999999684 | -42.691 | -49.188 | -59.745 |
| 9.009999999999684 | -42.782 | -49.282 | -59.846 |
| 9.019999999999683 | -42.873 | -49.377 | -59.948 |
| 9.029999999999683 | -42.965 | -49.472 | -60.049 |
| 9.039999999999681 | -43.056 | -49.567 | -60.151 |
| 9.049999999999683 | -43.148 | -49.662 | -60.252 |
| 9.05999999999968 | -43.24 | -49.757 | -60.354 |
| 9.06999999999968 | -43.331 | -49.853 | -60.456 |
| 9.07999999999968 | -43.423 | -49.948 | -60.558 |
| 9.08999999999968 | -43.515 | -50.044 | -60.66 |
| 9.09999999999968 | -43.607 | -50.139 | -60.762 |
| 9.10999999999968 | -43.699 | -50.235 | -60.864 |
| 9.11999999999968 | -43.792 | -50.331 | -60.966 |
| 9.12999999999968 | -43.884 | -50.426 | -61.068 |
| 9.13999999999968 | -43.976 | -50.522 | -61.171 |
| 9.14999999999968 | -44.069 | -50.618 | -61.273 |
| 9.15999999999968 | -44.162 | -50.714 | -61.376 |
| 9.16999999999968 | -44.254 | -50.811 | -61.478 |
| 9.17999999999968 | -44.347 | -50.907 | -61.581 |
| 9.18999999999968 | -44.44 | -51.003 | -61.684 |
| 9.19999999999968 | -44.533 | -51.1 | -61.787 |
| 9.20999999999968 | -44.626 | -51.197 | -61.89 |
| 9.21999999999968 | -44.72 | -51.293 | -61.993 |
| 9.229999999999677 | -44.813 | -51.39 | -62.096 |
| 9.239999999999679 | -44.906 | -51.487 | -62.199 |
| 9.249999999999678 | -45 | -51.584 | -62.303 |
| 9.259999999999678 | -45.094 | -51.681 | -62.406 |
| 9.269999999999678 | -45.187 | -51.778 | -62.51 |
| 9.279999999999678 | -45.281 | -51.876 | -62.613 |
| 9.289999999999678 | -45.375 | -51.973 | -62.717 |
| 9.299999999999677 | -45.469 | -52.07 | -62.821 |
| 9.309999999999677 | -45.563 | -52.168 | -62.925 |
| 9.319999999999675 | -45.658 | -52.266 | -63.028 |
| 9.329999999999677 | -45.752 | -52.363 | -63.132 |
| 9.339999999999677 | -45.846 | -52.461 | -63.237 |
| 9.349999999999676 | -45.941 | -52.559 | -63.341 |
| 9.359999999999676 | -46.036 | -52.657 | -63.445 |
| 9.369999999999674 | -46.13 | -52.755 | -63.549 |
| 9.379999999999676 | -46.225 | -52.853 | -63.654 |
| 9.389999999999675 | -46.32 | -52.952 | -63.758 |
| 9.399999999999675 | -46.415 | -53.05 | -63.863 |
| 9.409999999999675 | -46.51 | -53.149 | -63.968 |
| 9.419999999999675 | -46.605 | -53.247 | -64.072 |
| 9.429999999999675 | -46.701 | -53.346 | -64.177 |
| 9.439999999999674 | -46.796 | -53.445 | -64.282 |
| 9.449999999999674 | -46.892 | -53.544 | -64.387 |
| 9.459999999999672 | -46.987 | -53.643 | -64.492 |
| 9.469999999999674 | -47.083 | -53.742 | -64.598 |
| 9.479999999999674 | -47.179 | -53.841 | -64.703 |
| 9.489999999999673 | -47.275 | -53.94 | -64.808 |
| 9.499999999999673 | -47.371 | -54.04 | -64.914 |
| 9.509999999999671 | -47.467 | -54.139 | -65.019 |
| 9.519999999999673 | -47.563 | -54.239 | -65.125 |
| 9.529999999999673 | -47.659 | -54.338 | -65.231 |
| 9.539999999999672 | -47.756 | -54.438 | -65.337 |
| 9.549999999999672 | -47.852 | -54.538 | -65.443 |
| 9.55999999999967 | -47.949 | -54.638 | -65.549 |
| 9.56999999999967 | -48.046 | -54.738 | -65.655 |
| 9.57999999999967 | -48.142 | -54.838 | -65.761 |
| 9.58999999999967 | -48.239 | -54.938 | -65.867 |
| 9.59999999999967 | -48.336 | -55.038 | -65.973 |
| 9.60999999999967 | -48.433 | -55.139 | -66.08 |
| 9.61999999999967 | -48.531 | -55.239 | -66.186 |
| 9.62999999999967 | -48.628 | -55.34 | -66.293 |
| 9.63999999999967 | -48.725 | -55.44 | -66.4 |
| 9.64999999999967 | -48.823 | -55.541 | -66.506 |
| 9.65999999999967 | -48.92 | -55.642 | -66.613 |
| 9.66999999999967 | -49.018 | -55.743 | -66.72 |
| 9.67999999999967 | -49.116 | -55.844 | -66.827 |
| 9.689999999999667 | -49.214 | -55.945 | -66.934 |
| 9.699999999999669 | -49.312 | -56.047 | -67.042 |
| 9.709999999999669 | -49.41 | -56.148 | -67.149 |
| 9.719999999999668 | -49.508 | -56.249 | -67.256 |
| 9.729999999999668 | -49.606 | -56.351 | -67.364 |
| 9.739999999999666 | -49.705 | -56.453 | -67.471 |
| 9.749999999999668 | -49.803 | -56.554 | -67.579 |
| 9.759999999999668 | -49.902 | -56.656 | -67.687 |
| 9.769999999999667 | -50.001 | -56.758 | -67.795 |
| 9.779999999999667 | -50.099 | -56.86 | -67.903 |
| 9.789999999999665 | -50.198 | -56.962 | -68.011 |
| 9.799999999999667 | -50.297 | -57.064 | -68.119 |
| 9.809999999999667 | -50.396 | -57.167 | -68.227 |
| 9.819999999999666 | -50.495 | -57.269 | -68.335 |
| 9.829999999999666 | -50.595 | -57.372 | -68.443 |
| 9.839999999999664 | -50.694 | -57.474 | -68.552 |
| 9.849999999999666 | -50.794 | -57.577 | -68.66 |
| 9.859999999999665 | -50.893 | -57.68 | -68.769 |
| 9.869999999999665 | -50.993 | -57.783 | -68.878 |
| 9.879999999999663 | -51.093 | -57.886 | -68.987 |
| 9.889999999999665 | -51.192 | -57.989 | -69.095 |
| 9.899999999999665 | -51.292 | -58.092 | -69.204 |
| 9.909999999999664 | -51.392 | -58.195 | -69.313 |
| 9.919999999999664 | -51.493 | -58.298 | -69.423 |
| 9.929999999999662 | -51.593 | -58.402 | -69.532 |
| 9.939999999999664 | -51.693 | -58.505 | -69.641 |
| 9.949999999999664 | -51.794 | -58.609 | -69.751 |
| 9.95999999999966 | -51.894 | -58.713 | -69.86 |
| 9.96999999999966 | -51.995 | -58.817 | -69.97 |
| 9.97999999999966 | -52.096 | -58.921 | -70.079 |
| 9.98999999999966 | -52.197 | -59.025 | -70.189 |
| 9.99999999999966 | -52.298 | -59.129 | -70.299 |